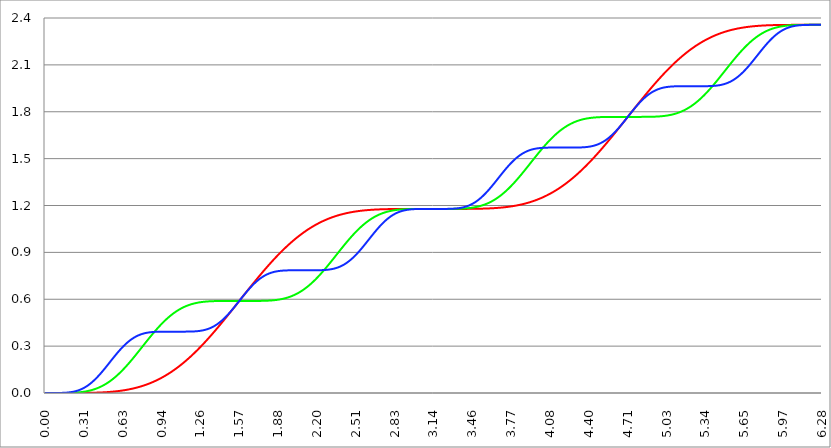
| Category | Series 1 | Series 0 | Series 2 |
|---|---|---|---|
| 0.0 | 0 | 0 | 0 |
| 0.00314159265358979 | 0 | 0 | 0 |
| 0.00628318530717958 | 0 | 0 | 0 |
| 0.00942477796076938 | 0 | 0 | 0 |
| 0.0125663706143592 | 0 | 0 | 0 |
| 0.015707963267949 | 0 | 0 | 0 |
| 0.0188495559215388 | 0 | 0 | 0 |
| 0.0219911485751285 | 0 | 0 | 0 |
| 0.0251327412287183 | 0 | 0 | 0 |
| 0.0282743338823081 | 0 | 0 | 0 |
| 0.0314159265358979 | 0 | 0 | 0 |
| 0.0345575191894877 | 0 | 0 | 0 |
| 0.0376991118430775 | 0 | 0 | 0 |
| 0.0408407044966673 | 0 | 0 | 0 |
| 0.0439822971502571 | 0 | 0 | 0 |
| 0.0471238898038469 | 0 | 0 | 0 |
| 0.0502654824574367 | 0 | 0 | 0 |
| 0.0534070751110265 | 0 | 0 | 0 |
| 0.0565486677646163 | 0 | 0 | 0 |
| 0.059690260418206 | 0 | 0 | 0 |
| 0.0628318530717958 | 0 | 0 | 0 |
| 0.0659734457253856 | 0 | 0 | 0 |
| 0.0691150383789754 | 0 | 0 | 0 |
| 0.0722566310325652 | 0 | 0 | 0 |
| 0.075398223686155 | 0 | 0 | 0 |
| 0.0785398163397448 | 0 | 0 | 0 |
| 0.0816814089933346 | 0 | 0 | 0 |
| 0.0848230016469244 | 0 | 0 | 0 |
| 0.0879645943005142 | 0 | 0 | 0 |
| 0.091106186954104 | 0 | 0 | 0 |
| 0.0942477796076937 | 0 | 0 | 0 |
| 0.0973893722612835 | 0 | 0 | 0 |
| 0.100530964914873 | 0 | 0 | 0 |
| 0.103672557568463 | 0 | 0 | 0 |
| 0.106814150222053 | 0 | 0 | 0 |
| 0.109955742875643 | 0 | 0 | 0 |
| 0.113097335529233 | 0 | 0 | 0 |
| 0.116238928182822 | 0 | 0 | 0 |
| 0.119380520836412 | 0 | 0 | 0 |
| 0.122522113490002 | 0 | 0 | 0 |
| 0.125663706143592 | 0 | 0 | 0 |
| 0.128805298797181 | 0 | 0 | 0.001 |
| 0.131946891450771 | 0 | 0 | 0.001 |
| 0.135088484104361 | 0 | 0 | 0.001 |
| 0.138230076757951 | 0 | 0 | 0.001 |
| 0.141371669411541 | 0 | 0 | 0.001 |
| 0.14451326206513 | 0 | 0 | 0.001 |
| 0.14765485471872 | 0 | 0 | 0.001 |
| 0.15079644737231 | 0 | 0 | 0.001 |
| 0.1539380400259 | 0 | 0 | 0.001 |
| 0.15707963267949 | 0 | 0 | 0.001 |
| 0.160221225333079 | 0 | 0 | 0.002 |
| 0.163362817986669 | 0 | 0 | 0.002 |
| 0.166504410640259 | 0 | 0 | 0.002 |
| 0.169646003293849 | 0 | 0 | 0.002 |
| 0.172787595947439 | 0 | 0 | 0.002 |
| 0.175929188601028 | 0 | 0.001 | 0.002 |
| 0.179070781254618 | 0 | 0.001 | 0.003 |
| 0.182212373908208 | 0 | 0.001 | 0.003 |
| 0.185353966561798 | 0 | 0.001 | 0.003 |
| 0.188495559215388 | 0 | 0.001 | 0.003 |
| 0.191637151868977 | 0 | 0.001 | 0.004 |
| 0.194778744522567 | 0 | 0.001 | 0.004 |
| 0.197920337176157 | 0 | 0.001 | 0.004 |
| 0.201061929829747 | 0 | 0.001 | 0.004 |
| 0.204203522483336 | 0 | 0.001 | 0.005 |
| 0.207345115136926 | 0 | 0.001 | 0.005 |
| 0.210486707790516 | 0 | 0.001 | 0.006 |
| 0.213628300444106 | 0 | 0.001 | 0.006 |
| 0.216769893097696 | 0 | 0.001 | 0.006 |
| 0.219911485751285 | 0 | 0.002 | 0.007 |
| 0.223053078404875 | 0 | 0.002 | 0.007 |
| 0.226194671058465 | 0 | 0.002 | 0.008 |
| 0.229336263712055 | 0 | 0.002 | 0.008 |
| 0.232477856365645 | 0 | 0.002 | 0.009 |
| 0.235619449019234 | 0 | 0.002 | 0.009 |
| 0.238761041672824 | 0 | 0.002 | 0.01 |
| 0.241902634326414 | 0 | 0.002 | 0.01 |
| 0.245044226980004 | 0 | 0.003 | 0.011 |
| 0.248185819633594 | 0 | 0.003 | 0.012 |
| 0.251327412287183 | 0 | 0.003 | 0.012 |
| 0.254469004940773 | 0 | 0.003 | 0.013 |
| 0.257610597594363 | 0 | 0.003 | 0.014 |
| 0.260752190247953 | 0 | 0.003 | 0.015 |
| 0.263893782901543 | 0 | 0.004 | 0.015 |
| 0.267035375555132 | 0 | 0.004 | 0.016 |
| 0.270176968208722 | 0 | 0.004 | 0.017 |
| 0.273318560862312 | 0 | 0.004 | 0.018 |
| 0.276460153515902 | 0 | 0.004 | 0.019 |
| 0.279601746169492 | 0 | 0.005 | 0.02 |
| 0.282743338823082 | 0 | 0.005 | 0.021 |
| 0.285884931476671 | 0 | 0.005 | 0.022 |
| 0.289026524130261 | 0 | 0.006 | 0.023 |
| 0.292168116783851 | 0 | 0.006 | 0.024 |
| 0.295309709437441 | 0 | 0.006 | 0.025 |
| 0.298451302091031 | 0 | 0.006 | 0.026 |
| 0.30159289474462 | 0 | 0.007 | 0.027 |
| 0.30473448739821 | 0.001 | 0.007 | 0.029 |
| 0.3078760800518 | 0.001 | 0.007 | 0.03 |
| 0.31101767270539 | 0.001 | 0.008 | 0.031 |
| 0.31415926535898 | 0.001 | 0.008 | 0.032 |
| 0.31730085801257 | 0.001 | 0.008 | 0.034 |
| 0.320442450666159 | 0.001 | 0.009 | 0.035 |
| 0.323584043319749 | 0.001 | 0.009 | 0.037 |
| 0.326725635973339 | 0.001 | 0.01 | 0.038 |
| 0.329867228626929 | 0.001 | 0.01 | 0.04 |
| 0.333008821280519 | 0.001 | 0.011 | 0.041 |
| 0.336150413934108 | 0.001 | 0.011 | 0.043 |
| 0.339292006587698 | 0.001 | 0.012 | 0.044 |
| 0.342433599241288 | 0.001 | 0.012 | 0.046 |
| 0.345575191894878 | 0.001 | 0.013 | 0.048 |
| 0.348716784548468 | 0.001 | 0.013 | 0.05 |
| 0.351858377202058 | 0.001 | 0.014 | 0.051 |
| 0.354999969855647 | 0.001 | 0.014 | 0.053 |
| 0.358141562509237 | 0.001 | 0.015 | 0.055 |
| 0.361283155162827 | 0.001 | 0.015 | 0.057 |
| 0.364424747816417 | 0.001 | 0.016 | 0.059 |
| 0.367566340470007 | 0.001 | 0.017 | 0.061 |
| 0.370707933123597 | 0.001 | 0.017 | 0.063 |
| 0.373849525777186 | 0.001 | 0.018 | 0.065 |
| 0.376991118430776 | 0.001 | 0.019 | 0.067 |
| 0.380132711084366 | 0.001 | 0.019 | 0.069 |
| 0.383274303737956 | 0.002 | 0.02 | 0.071 |
| 0.386415896391546 | 0.002 | 0.021 | 0.073 |
| 0.389557489045135 | 0.002 | 0.021 | 0.076 |
| 0.392699081698725 | 0.002 | 0.022 | 0.078 |
| 0.395840674352315 | 0.002 | 0.023 | 0.08 |
| 0.398982267005905 | 0.002 | 0.024 | 0.083 |
| 0.402123859659495 | 0.002 | 0.025 | 0.085 |
| 0.405265452313085 | 0.002 | 0.026 | 0.087 |
| 0.408407044966674 | 0.002 | 0.026 | 0.09 |
| 0.411548637620264 | 0.002 | 0.027 | 0.092 |
| 0.414690230273854 | 0.002 | 0.028 | 0.095 |
| 0.417831822927444 | 0.002 | 0.029 | 0.097 |
| 0.420973415581034 | 0.002 | 0.03 | 0.1 |
| 0.424115008234623 | 0.003 | 0.031 | 0.103 |
| 0.427256600888213 | 0.003 | 0.032 | 0.105 |
| 0.430398193541803 | 0.003 | 0.033 | 0.108 |
| 0.433539786195393 | 0.003 | 0.034 | 0.111 |
| 0.436681378848983 | 0.003 | 0.035 | 0.113 |
| 0.439822971502573 | 0.003 | 0.036 | 0.116 |
| 0.442964564156162 | 0.003 | 0.038 | 0.119 |
| 0.446106156809752 | 0.003 | 0.039 | 0.122 |
| 0.449247749463342 | 0.003 | 0.04 | 0.124 |
| 0.452389342116932 | 0.003 | 0.041 | 0.127 |
| 0.455530934770522 | 0.004 | 0.042 | 0.13 |
| 0.458672527424111 | 0.004 | 0.043 | 0.133 |
| 0.461814120077701 | 0.004 | 0.045 | 0.136 |
| 0.464955712731291 | 0.004 | 0.046 | 0.139 |
| 0.468097305384881 | 0.004 | 0.047 | 0.142 |
| 0.471238898038471 | 0.004 | 0.049 | 0.145 |
| 0.474380490692061 | 0.004 | 0.05 | 0.148 |
| 0.47752208334565 | 0.004 | 0.051 | 0.151 |
| 0.48066367599924 | 0.005 | 0.053 | 0.154 |
| 0.48380526865283 | 0.005 | 0.054 | 0.157 |
| 0.48694686130642 | 0.005 | 0.056 | 0.16 |
| 0.49008845396001 | 0.005 | 0.057 | 0.163 |
| 0.493230046613599 | 0.005 | 0.059 | 0.166 |
| 0.496371639267189 | 0.005 | 0.06 | 0.169 |
| 0.499513231920779 | 0.006 | 0.062 | 0.172 |
| 0.502654824574369 | 0.006 | 0.063 | 0.175 |
| 0.505796417227959 | 0.006 | 0.065 | 0.179 |
| 0.508938009881549 | 0.006 | 0.067 | 0.182 |
| 0.512079602535138 | 0.006 | 0.068 | 0.185 |
| 0.515221195188728 | 0.006 | 0.07 | 0.188 |
| 0.518362787842318 | 0.007 | 0.072 | 0.191 |
| 0.521504380495908 | 0.007 | 0.073 | 0.194 |
| 0.524645973149498 | 0.007 | 0.075 | 0.197 |
| 0.527787565803087 | 0.007 | 0.077 | 0.201 |
| 0.530929158456677 | 0.007 | 0.079 | 0.204 |
| 0.534070751110267 | 0.008 | 0.081 | 0.207 |
| 0.537212343763857 | 0.008 | 0.082 | 0.21 |
| 0.540353936417447 | 0.008 | 0.084 | 0.213 |
| 0.543495529071037 | 0.008 | 0.086 | 0.216 |
| 0.546637121724626 | 0.008 | 0.088 | 0.219 |
| 0.549778714378216 | 0.009 | 0.09 | 0.222 |
| 0.552920307031806 | 0.009 | 0.092 | 0.226 |
| 0.556061899685396 | 0.009 | 0.094 | 0.229 |
| 0.559203492338986 | 0.009 | 0.096 | 0.232 |
| 0.562345084992576 | 0.01 | 0.098 | 0.235 |
| 0.565486677646165 | 0.01 | 0.1 | 0.238 |
| 0.568628270299755 | 0.01 | 0.103 | 0.241 |
| 0.571769862953345 | 0.01 | 0.105 | 0.244 |
| 0.574911455606935 | 0.011 | 0.107 | 0.247 |
| 0.578053048260525 | 0.011 | 0.109 | 0.25 |
| 0.581194640914114 | 0.011 | 0.111 | 0.253 |
| 0.584336233567704 | 0.012 | 0.113 | 0.256 |
| 0.587477826221294 | 0.012 | 0.116 | 0.259 |
| 0.590619418874884 | 0.012 | 0.118 | 0.262 |
| 0.593761011528474 | 0.012 | 0.12 | 0.264 |
| 0.596902604182064 | 0.013 | 0.123 | 0.267 |
| 0.600044196835653 | 0.013 | 0.125 | 0.27 |
| 0.603185789489243 | 0.013 | 0.127 | 0.273 |
| 0.606327382142833 | 0.014 | 0.13 | 0.276 |
| 0.609468974796423 | 0.014 | 0.132 | 0.279 |
| 0.612610567450013 | 0.014 | 0.135 | 0.281 |
| 0.615752160103602 | 0.015 | 0.137 | 0.284 |
| 0.618893752757192 | 0.015 | 0.14 | 0.287 |
| 0.622035345410782 | 0.015 | 0.142 | 0.289 |
| 0.625176938064372 | 0.016 | 0.145 | 0.292 |
| 0.628318530717962 | 0.016 | 0.147 | 0.295 |
| 0.631460123371551 | 0.017 | 0.15 | 0.297 |
| 0.634601716025141 | 0.017 | 0.152 | 0.3 |
| 0.637743308678731 | 0.017 | 0.155 | 0.302 |
| 0.640884901332321 | 0.018 | 0.158 | 0.305 |
| 0.644026493985911 | 0.018 | 0.16 | 0.307 |
| 0.647168086639501 | 0.019 | 0.163 | 0.309 |
| 0.65030967929309 | 0.019 | 0.166 | 0.312 |
| 0.65345127194668 | 0.019 | 0.168 | 0.314 |
| 0.65659286460027 | 0.02 | 0.171 | 0.316 |
| 0.65973445725386 | 0.02 | 0.174 | 0.319 |
| 0.66287604990745 | 0.021 | 0.177 | 0.321 |
| 0.666017642561039 | 0.021 | 0.18 | 0.323 |
| 0.669159235214629 | 0.022 | 0.182 | 0.325 |
| 0.672300827868219 | 0.022 | 0.185 | 0.327 |
| 0.675442420521809 | 0.023 | 0.188 | 0.329 |
| 0.678584013175399 | 0.023 | 0.191 | 0.331 |
| 0.681725605828989 | 0.024 | 0.194 | 0.333 |
| 0.684867198482578 | 0.024 | 0.197 | 0.335 |
| 0.688008791136168 | 0.025 | 0.2 | 0.337 |
| 0.691150383789758 | 0.025 | 0.202 | 0.339 |
| 0.694291976443348 | 0.026 | 0.205 | 0.341 |
| 0.697433569096938 | 0.026 | 0.208 | 0.343 |
| 0.700575161750528 | 0.027 | 0.211 | 0.344 |
| 0.703716754404117 | 0.027 | 0.214 | 0.346 |
| 0.706858347057707 | 0.028 | 0.217 | 0.348 |
| 0.709999939711297 | 0.028 | 0.22 | 0.349 |
| 0.713141532364887 | 0.029 | 0.223 | 0.351 |
| 0.716283125018477 | 0.03 | 0.226 | 0.353 |
| 0.719424717672066 | 0.03 | 0.229 | 0.354 |
| 0.722566310325656 | 0.031 | 0.232 | 0.356 |
| 0.725707902979246 | 0.031 | 0.235 | 0.357 |
| 0.728849495632836 | 0.032 | 0.238 | 0.358 |
| 0.731991088286426 | 0.033 | 0.242 | 0.36 |
| 0.735132680940016 | 0.033 | 0.245 | 0.361 |
| 0.738274273593605 | 0.034 | 0.248 | 0.362 |
| 0.741415866247195 | 0.034 | 0.251 | 0.364 |
| 0.744557458900785 | 0.035 | 0.254 | 0.365 |
| 0.747699051554375 | 0.036 | 0.257 | 0.366 |
| 0.750840644207965 | 0.036 | 0.26 | 0.367 |
| 0.753982236861554 | 0.037 | 0.263 | 0.368 |
| 0.757123829515144 | 0.038 | 0.266 | 0.37 |
| 0.760265422168734 | 0.039 | 0.269 | 0.371 |
| 0.763407014822324 | 0.039 | 0.273 | 0.372 |
| 0.766548607475914 | 0.04 | 0.276 | 0.373 |
| 0.769690200129504 | 0.041 | 0.279 | 0.374 |
| 0.772831792783093 | 0.041 | 0.282 | 0.374 |
| 0.775973385436683 | 0.042 | 0.285 | 0.375 |
| 0.779114978090273 | 0.043 | 0.288 | 0.376 |
| 0.782256570743863 | 0.044 | 0.291 | 0.377 |
| 0.785398163397453 | 0.045 | 0.295 | 0.378 |
| 0.788539756051042 | 0.045 | 0.298 | 0.379 |
| 0.791681348704632 | 0.046 | 0.301 | 0.379 |
| 0.794822941358222 | 0.047 | 0.304 | 0.38 |
| 0.797964534011812 | 0.048 | 0.307 | 0.381 |
| 0.801106126665402 | 0.049 | 0.31 | 0.381 |
| 0.804247719318992 | 0.049 | 0.313 | 0.382 |
| 0.807389311972581 | 0.05 | 0.316 | 0.383 |
| 0.810530904626171 | 0.051 | 0.32 | 0.383 |
| 0.813672497279761 | 0.052 | 0.323 | 0.384 |
| 0.816814089933351 | 0.053 | 0.326 | 0.384 |
| 0.819955682586941 | 0.054 | 0.329 | 0.385 |
| 0.823097275240531 | 0.055 | 0.332 | 0.385 |
| 0.82623886789412 | 0.056 | 0.335 | 0.386 |
| 0.82938046054771 | 0.057 | 0.338 | 0.386 |
| 0.8325220532013 | 0.057 | 0.341 | 0.387 |
| 0.83566364585489 | 0.058 | 0.344 | 0.387 |
| 0.83880523850848 | 0.059 | 0.348 | 0.387 |
| 0.841946831162069 | 0.06 | 0.351 | 0.388 |
| 0.845088423815659 | 0.061 | 0.354 | 0.388 |
| 0.848230016469249 | 0.062 | 0.357 | 0.388 |
| 0.851371609122839 | 0.063 | 0.36 | 0.389 |
| 0.854513201776429 | 0.064 | 0.363 | 0.389 |
| 0.857654794430019 | 0.065 | 0.366 | 0.389 |
| 0.860796387083608 | 0.066 | 0.369 | 0.39 |
| 0.863937979737198 | 0.067 | 0.372 | 0.39 |
| 0.867079572390788 | 0.068 | 0.375 | 0.39 |
| 0.870221165044378 | 0.07 | 0.378 | 0.39 |
| 0.873362757697968 | 0.071 | 0.381 | 0.39 |
| 0.876504350351557 | 0.072 | 0.384 | 0.391 |
| 0.879645943005147 | 0.073 | 0.387 | 0.391 |
| 0.882787535658737 | 0.074 | 0.389 | 0.391 |
| 0.885929128312327 | 0.075 | 0.392 | 0.391 |
| 0.889070720965917 | 0.076 | 0.395 | 0.391 |
| 0.892212313619507 | 0.077 | 0.398 | 0.391 |
| 0.895353906273096 | 0.078 | 0.401 | 0.392 |
| 0.898495498926686 | 0.08 | 0.404 | 0.392 |
| 0.901637091580276 | 0.081 | 0.407 | 0.392 |
| 0.904778684233866 | 0.082 | 0.409 | 0.392 |
| 0.907920276887456 | 0.083 | 0.412 | 0.392 |
| 0.911061869541045 | 0.084 | 0.415 | 0.392 |
| 0.914203462194635 | 0.086 | 0.418 | 0.392 |
| 0.917345054848225 | 0.087 | 0.421 | 0.392 |
| 0.920486647501815 | 0.088 | 0.423 | 0.392 |
| 0.923628240155405 | 0.089 | 0.426 | 0.392 |
| 0.926769832808995 | 0.091 | 0.429 | 0.392 |
| 0.929911425462584 | 0.092 | 0.431 | 0.392 |
| 0.933053018116174 | 0.093 | 0.434 | 0.392 |
| 0.936194610769764 | 0.095 | 0.437 | 0.392 |
| 0.939336203423354 | 0.096 | 0.439 | 0.392 |
| 0.942477796076944 | 0.097 | 0.442 | 0.393 |
| 0.945619388730533 | 0.099 | 0.444 | 0.393 |
| 0.948760981384123 | 0.1 | 0.447 | 0.393 |
| 0.951902574037713 | 0.101 | 0.449 | 0.393 |
| 0.955044166691303 | 0.103 | 0.452 | 0.393 |
| 0.958185759344893 | 0.104 | 0.454 | 0.393 |
| 0.961327351998483 | 0.106 | 0.457 | 0.393 |
| 0.964468944652072 | 0.107 | 0.459 | 0.393 |
| 0.967610537305662 | 0.108 | 0.462 | 0.393 |
| 0.970752129959252 | 0.11 | 0.464 | 0.393 |
| 0.973893722612842 | 0.111 | 0.466 | 0.393 |
| 0.977035315266432 | 0.113 | 0.469 | 0.393 |
| 0.980176907920022 | 0.114 | 0.471 | 0.393 |
| 0.983318500573611 | 0.116 | 0.473 | 0.393 |
| 0.986460093227201 | 0.117 | 0.476 | 0.393 |
| 0.989601685880791 | 0.119 | 0.478 | 0.393 |
| 0.992743278534381 | 0.12 | 0.48 | 0.393 |
| 0.995884871187971 | 0.122 | 0.482 | 0.393 |
| 0.99902646384156 | 0.124 | 0.484 | 0.393 |
| 1.00216805649515 | 0.125 | 0.487 | 0.393 |
| 1.00530964914874 | 0.127 | 0.489 | 0.393 |
| 1.00845124180233 | 0.128 | 0.491 | 0.393 |
| 1.01159283445592 | 0.13 | 0.493 | 0.393 |
| 1.01473442710951 | 0.132 | 0.495 | 0.393 |
| 1.017876019763099 | 0.133 | 0.497 | 0.393 |
| 1.021017612416689 | 0.135 | 0.499 | 0.393 |
| 1.02415920507028 | 0.137 | 0.501 | 0.393 |
| 1.027300797723869 | 0.138 | 0.503 | 0.393 |
| 1.030442390377459 | 0.14 | 0.505 | 0.393 |
| 1.033583983031048 | 0.142 | 0.507 | 0.393 |
| 1.036725575684638 | 0.143 | 0.508 | 0.393 |
| 1.039867168338228 | 0.145 | 0.51 | 0.393 |
| 1.043008760991818 | 0.147 | 0.512 | 0.393 |
| 1.046150353645408 | 0.149 | 0.514 | 0.393 |
| 1.049291946298998 | 0.15 | 0.516 | 0.393 |
| 1.052433538952587 | 0.152 | 0.517 | 0.393 |
| 1.055575131606177 | 0.154 | 0.519 | 0.393 |
| 1.058716724259767 | 0.156 | 0.521 | 0.393 |
| 1.061858316913357 | 0.158 | 0.522 | 0.393 |
| 1.064999909566947 | 0.159 | 0.524 | 0.393 |
| 1.068141502220536 | 0.161 | 0.526 | 0.393 |
| 1.071283094874126 | 0.163 | 0.527 | 0.393 |
| 1.074424687527716 | 0.165 | 0.529 | 0.393 |
| 1.077566280181306 | 0.167 | 0.53 | 0.393 |
| 1.080707872834896 | 0.169 | 0.532 | 0.393 |
| 1.083849465488486 | 0.171 | 0.533 | 0.393 |
| 1.086991058142075 | 0.173 | 0.535 | 0.393 |
| 1.090132650795665 | 0.174 | 0.536 | 0.393 |
| 1.093274243449255 | 0.176 | 0.538 | 0.393 |
| 1.096415836102845 | 0.178 | 0.539 | 0.393 |
| 1.099557428756435 | 0.18 | 0.54 | 0.393 |
| 1.102699021410025 | 0.182 | 0.542 | 0.393 |
| 1.105840614063614 | 0.184 | 0.543 | 0.393 |
| 1.108982206717204 | 0.186 | 0.544 | 0.393 |
| 1.112123799370794 | 0.188 | 0.546 | 0.393 |
| 1.115265392024384 | 0.19 | 0.547 | 0.393 |
| 1.118406984677974 | 0.192 | 0.548 | 0.393 |
| 1.121548577331563 | 0.195 | 0.549 | 0.393 |
| 1.124690169985153 | 0.197 | 0.55 | 0.393 |
| 1.127831762638743 | 0.199 | 0.552 | 0.393 |
| 1.130973355292333 | 0.201 | 0.553 | 0.393 |
| 1.134114947945923 | 0.203 | 0.554 | 0.393 |
| 1.137256540599513 | 0.205 | 0.555 | 0.393 |
| 1.140398133253102 | 0.207 | 0.556 | 0.393 |
| 1.143539725906692 | 0.209 | 0.557 | 0.393 |
| 1.146681318560282 | 0.211 | 0.558 | 0.393 |
| 1.149822911213872 | 0.214 | 0.559 | 0.393 |
| 1.152964503867462 | 0.216 | 0.56 | 0.393 |
| 1.156106096521051 | 0.218 | 0.561 | 0.393 |
| 1.159247689174641 | 0.22 | 0.562 | 0.393 |
| 1.162389281828231 | 0.222 | 0.563 | 0.393 |
| 1.165530874481821 | 0.225 | 0.563 | 0.393 |
| 1.168672467135411 | 0.227 | 0.564 | 0.393 |
| 1.171814059789001 | 0.229 | 0.565 | 0.393 |
| 1.17495565244259 | 0.231 | 0.566 | 0.393 |
| 1.17809724509618 | 0.234 | 0.567 | 0.393 |
| 1.18123883774977 | 0.236 | 0.568 | 0.393 |
| 1.18438043040336 | 0.238 | 0.568 | 0.393 |
| 1.18752202305695 | 0.241 | 0.569 | 0.394 |
| 1.190663615710539 | 0.243 | 0.57 | 0.394 |
| 1.193805208364129 | 0.245 | 0.57 | 0.394 |
| 1.19694680101772 | 0.248 | 0.571 | 0.394 |
| 1.200088393671309 | 0.25 | 0.572 | 0.394 |
| 1.203229986324899 | 0.252 | 0.572 | 0.394 |
| 1.206371578978489 | 0.255 | 0.573 | 0.394 |
| 1.209513171632078 | 0.257 | 0.574 | 0.394 |
| 1.212654764285668 | 0.26 | 0.574 | 0.394 |
| 1.215796356939258 | 0.262 | 0.575 | 0.395 |
| 1.218937949592848 | 0.265 | 0.575 | 0.395 |
| 1.222079542246438 | 0.267 | 0.576 | 0.395 |
| 1.225221134900027 | 0.269 | 0.576 | 0.395 |
| 1.228362727553617 | 0.272 | 0.577 | 0.395 |
| 1.231504320207207 | 0.274 | 0.577 | 0.396 |
| 1.234645912860797 | 0.277 | 0.578 | 0.396 |
| 1.237787505514387 | 0.279 | 0.578 | 0.396 |
| 1.240929098167977 | 0.282 | 0.579 | 0.396 |
| 1.244070690821566 | 0.284 | 0.579 | 0.397 |
| 1.247212283475156 | 0.287 | 0.58 | 0.397 |
| 1.250353876128746 | 0.289 | 0.58 | 0.397 |
| 1.253495468782336 | 0.292 | 0.581 | 0.398 |
| 1.256637061435926 | 0.295 | 0.581 | 0.398 |
| 1.259778654089515 | 0.297 | 0.581 | 0.398 |
| 1.262920246743105 | 0.3 | 0.582 | 0.399 |
| 1.266061839396695 | 0.302 | 0.582 | 0.399 |
| 1.269203432050285 | 0.305 | 0.582 | 0.4 |
| 1.272345024703875 | 0.308 | 0.583 | 0.4 |
| 1.275486617357465 | 0.31 | 0.583 | 0.401 |
| 1.278628210011054 | 0.313 | 0.583 | 0.401 |
| 1.281769802664644 | 0.315 | 0.584 | 0.402 |
| 1.284911395318234 | 0.318 | 0.584 | 0.402 |
| 1.288052987971824 | 0.321 | 0.584 | 0.403 |
| 1.291194580625414 | 0.323 | 0.584 | 0.404 |
| 1.294336173279003 | 0.326 | 0.585 | 0.404 |
| 1.297477765932593 | 0.329 | 0.585 | 0.405 |
| 1.300619358586183 | 0.332 | 0.585 | 0.406 |
| 1.303760951239773 | 0.334 | 0.585 | 0.406 |
| 1.306902543893363 | 0.337 | 0.585 | 0.407 |
| 1.310044136546953 | 0.34 | 0.586 | 0.408 |
| 1.313185729200542 | 0.342 | 0.586 | 0.409 |
| 1.316327321854132 | 0.345 | 0.586 | 0.409 |
| 1.319468914507722 | 0.348 | 0.586 | 0.41 |
| 1.322610507161312 | 0.351 | 0.586 | 0.411 |
| 1.325752099814902 | 0.354 | 0.587 | 0.412 |
| 1.328893692468491 | 0.356 | 0.587 | 0.413 |
| 1.332035285122081 | 0.359 | 0.587 | 0.414 |
| 1.335176877775671 | 0.362 | 0.587 | 0.415 |
| 1.338318470429261 | 0.365 | 0.587 | 0.416 |
| 1.341460063082851 | 0.368 | 0.587 | 0.417 |
| 1.344601655736441 | 0.37 | 0.587 | 0.418 |
| 1.34774324839003 | 0.373 | 0.587 | 0.42 |
| 1.35088484104362 | 0.376 | 0.588 | 0.421 |
| 1.35402643369721 | 0.379 | 0.588 | 0.422 |
| 1.3571680263508 | 0.382 | 0.588 | 0.423 |
| 1.36030961900439 | 0.385 | 0.588 | 0.425 |
| 1.363451211657979 | 0.388 | 0.588 | 0.426 |
| 1.36659280431157 | 0.39 | 0.588 | 0.427 |
| 1.369734396965159 | 0.393 | 0.588 | 0.429 |
| 1.372875989618749 | 0.396 | 0.588 | 0.43 |
| 1.376017582272339 | 0.399 | 0.588 | 0.432 |
| 1.379159174925929 | 0.402 | 0.588 | 0.433 |
| 1.382300767579518 | 0.405 | 0.588 | 0.435 |
| 1.385442360233108 | 0.408 | 0.588 | 0.437 |
| 1.388583952886698 | 0.411 | 0.588 | 0.438 |
| 1.391725545540288 | 0.414 | 0.588 | 0.44 |
| 1.394867138193878 | 0.417 | 0.589 | 0.442 |
| 1.398008730847468 | 0.42 | 0.589 | 0.443 |
| 1.401150323501057 | 0.423 | 0.589 | 0.445 |
| 1.404291916154647 | 0.426 | 0.589 | 0.447 |
| 1.407433508808237 | 0.429 | 0.589 | 0.449 |
| 1.410575101461827 | 0.432 | 0.589 | 0.451 |
| 1.413716694115417 | 0.435 | 0.589 | 0.453 |
| 1.416858286769006 | 0.438 | 0.589 | 0.455 |
| 1.419999879422596 | 0.441 | 0.589 | 0.457 |
| 1.423141472076186 | 0.444 | 0.589 | 0.459 |
| 1.426283064729776 | 0.447 | 0.589 | 0.461 |
| 1.429424657383366 | 0.45 | 0.589 | 0.463 |
| 1.432566250036956 | 0.453 | 0.589 | 0.465 |
| 1.435707842690545 | 0.456 | 0.589 | 0.468 |
| 1.438849435344135 | 0.459 | 0.589 | 0.47 |
| 1.441991027997725 | 0.462 | 0.589 | 0.472 |
| 1.445132620651315 | 0.465 | 0.589 | 0.474 |
| 1.448274213304905 | 0.468 | 0.589 | 0.477 |
| 1.451415805958494 | 0.471 | 0.589 | 0.479 |
| 1.454557398612084 | 0.474 | 0.589 | 0.482 |
| 1.457698991265674 | 0.477 | 0.589 | 0.484 |
| 1.460840583919264 | 0.48 | 0.589 | 0.487 |
| 1.463982176572854 | 0.483 | 0.589 | 0.489 |
| 1.467123769226444 | 0.486 | 0.589 | 0.492 |
| 1.470265361880033 | 0.489 | 0.589 | 0.494 |
| 1.473406954533623 | 0.492 | 0.589 | 0.497 |
| 1.476548547187213 | 0.495 | 0.589 | 0.5 |
| 1.479690139840803 | 0.498 | 0.589 | 0.502 |
| 1.482831732494393 | 0.502 | 0.589 | 0.505 |
| 1.485973325147982 | 0.505 | 0.589 | 0.508 |
| 1.489114917801572 | 0.508 | 0.589 | 0.511 |
| 1.492256510455162 | 0.511 | 0.589 | 0.513 |
| 1.495398103108752 | 0.514 | 0.589 | 0.516 |
| 1.498539695762342 | 0.517 | 0.589 | 0.519 |
| 1.501681288415932 | 0.52 | 0.589 | 0.522 |
| 1.504822881069521 | 0.523 | 0.589 | 0.525 |
| 1.507964473723111 | 0.526 | 0.589 | 0.528 |
| 1.511106066376701 | 0.529 | 0.589 | 0.531 |
| 1.514247659030291 | 0.533 | 0.589 | 0.534 |
| 1.517389251683881 | 0.536 | 0.589 | 0.537 |
| 1.520530844337471 | 0.539 | 0.589 | 0.54 |
| 1.52367243699106 | 0.542 | 0.589 | 0.543 |
| 1.52681402964465 | 0.545 | 0.589 | 0.546 |
| 1.52995562229824 | 0.548 | 0.589 | 0.549 |
| 1.53309721495183 | 0.551 | 0.589 | 0.552 |
| 1.53623880760542 | 0.555 | 0.589 | 0.555 |
| 1.539380400259009 | 0.558 | 0.589 | 0.558 |
| 1.542521992912599 | 0.561 | 0.589 | 0.561 |
| 1.545663585566189 | 0.564 | 0.589 | 0.564 |
| 1.548805178219779 | 0.567 | 0.589 | 0.567 |
| 1.551946770873369 | 0.57 | 0.589 | 0.57 |
| 1.555088363526959 | 0.573 | 0.589 | 0.573 |
| 1.558229956180548 | 0.576 | 0.589 | 0.576 |
| 1.561371548834138 | 0.58 | 0.589 | 0.58 |
| 1.564513141487728 | 0.583 | 0.589 | 0.583 |
| 1.567654734141318 | 0.586 | 0.589 | 0.586 |
| 1.570796326794908 | 0.589 | 0.589 | 0.589 |
| 1.573937919448497 | 0.592 | 0.589 | 0.592 |
| 1.577079512102087 | 0.595 | 0.589 | 0.595 |
| 1.580221104755677 | 0.598 | 0.589 | 0.598 |
| 1.583362697409267 | 0.602 | 0.589 | 0.602 |
| 1.586504290062857 | 0.605 | 0.589 | 0.605 |
| 1.589645882716447 | 0.608 | 0.589 | 0.608 |
| 1.592787475370036 | 0.611 | 0.589 | 0.611 |
| 1.595929068023626 | 0.614 | 0.589 | 0.614 |
| 1.599070660677216 | 0.617 | 0.589 | 0.617 |
| 1.602212253330806 | 0.62 | 0.589 | 0.62 |
| 1.605353845984396 | 0.624 | 0.589 | 0.623 |
| 1.608495438637985 | 0.627 | 0.589 | 0.626 |
| 1.611637031291575 | 0.63 | 0.589 | 0.629 |
| 1.614778623945165 | 0.633 | 0.589 | 0.633 |
| 1.617920216598755 | 0.636 | 0.589 | 0.636 |
| 1.621061809252345 | 0.639 | 0.589 | 0.639 |
| 1.624203401905935 | 0.642 | 0.589 | 0.642 |
| 1.627344994559524 | 0.645 | 0.589 | 0.645 |
| 1.630486587213114 | 0.649 | 0.589 | 0.647 |
| 1.633628179866704 | 0.652 | 0.589 | 0.65 |
| 1.636769772520294 | 0.655 | 0.589 | 0.653 |
| 1.639911365173884 | 0.658 | 0.589 | 0.656 |
| 1.643052957827473 | 0.661 | 0.589 | 0.659 |
| 1.646194550481063 | 0.664 | 0.589 | 0.662 |
| 1.649336143134653 | 0.667 | 0.589 | 0.665 |
| 1.652477735788243 | 0.67 | 0.589 | 0.668 |
| 1.655619328441833 | 0.673 | 0.589 | 0.67 |
| 1.658760921095423 | 0.677 | 0.589 | 0.673 |
| 1.661902513749012 | 0.68 | 0.589 | 0.676 |
| 1.665044106402602 | 0.683 | 0.589 | 0.678 |
| 1.668185699056192 | 0.686 | 0.589 | 0.681 |
| 1.671327291709782 | 0.689 | 0.589 | 0.684 |
| 1.674468884363372 | 0.692 | 0.589 | 0.686 |
| 1.677610477016961 | 0.695 | 0.589 | 0.689 |
| 1.680752069670551 | 0.698 | 0.589 | 0.691 |
| 1.683893662324141 | 0.701 | 0.589 | 0.694 |
| 1.687035254977731 | 0.704 | 0.589 | 0.696 |
| 1.690176847631321 | 0.707 | 0.589 | 0.699 |
| 1.693318440284911 | 0.71 | 0.589 | 0.701 |
| 1.6964600329385 | 0.713 | 0.589 | 0.704 |
| 1.69960162559209 | 0.716 | 0.589 | 0.706 |
| 1.70274321824568 | 0.719 | 0.589 | 0.708 |
| 1.70588481089927 | 0.723 | 0.589 | 0.71 |
| 1.70902640355286 | 0.726 | 0.589 | 0.713 |
| 1.712167996206449 | 0.729 | 0.589 | 0.715 |
| 1.715309588860039 | 0.732 | 0.589 | 0.717 |
| 1.71845118151363 | 0.735 | 0.589 | 0.719 |
| 1.721592774167219 | 0.738 | 0.589 | 0.721 |
| 1.724734366820809 | 0.741 | 0.589 | 0.723 |
| 1.727875959474399 | 0.744 | 0.589 | 0.725 |
| 1.731017552127988 | 0.747 | 0.589 | 0.727 |
| 1.734159144781578 | 0.75 | 0.589 | 0.729 |
| 1.737300737435168 | 0.753 | 0.589 | 0.731 |
| 1.740442330088758 | 0.755 | 0.589 | 0.733 |
| 1.743583922742348 | 0.758 | 0.59 | 0.735 |
| 1.746725515395937 | 0.761 | 0.59 | 0.736 |
| 1.749867108049527 | 0.764 | 0.59 | 0.738 |
| 1.753008700703117 | 0.767 | 0.59 | 0.74 |
| 1.756150293356707 | 0.77 | 0.59 | 0.742 |
| 1.759291886010297 | 0.773 | 0.59 | 0.743 |
| 1.762433478663887 | 0.776 | 0.59 | 0.745 |
| 1.765575071317476 | 0.779 | 0.59 | 0.746 |
| 1.768716663971066 | 0.782 | 0.59 | 0.748 |
| 1.771858256624656 | 0.785 | 0.59 | 0.749 |
| 1.774999849278246 | 0.788 | 0.59 | 0.751 |
| 1.778141441931836 | 0.791 | 0.59 | 0.752 |
| 1.781283034585426 | 0.793 | 0.59 | 0.753 |
| 1.784424627239015 | 0.796 | 0.59 | 0.755 |
| 1.787566219892605 | 0.799 | 0.59 | 0.756 |
| 1.790707812546195 | 0.802 | 0.591 | 0.757 |
| 1.793849405199785 | 0.805 | 0.591 | 0.758 |
| 1.796990997853375 | 0.808 | 0.591 | 0.76 |
| 1.800132590506964 | 0.811 | 0.591 | 0.761 |
| 1.803274183160554 | 0.813 | 0.591 | 0.762 |
| 1.806415775814144 | 0.816 | 0.591 | 0.763 |
| 1.809557368467734 | 0.819 | 0.591 | 0.764 |
| 1.812698961121324 | 0.822 | 0.591 | 0.765 |
| 1.815840553774914 | 0.825 | 0.592 | 0.766 |
| 1.818982146428503 | 0.827 | 0.592 | 0.767 |
| 1.822123739082093 | 0.83 | 0.592 | 0.768 |
| 1.825265331735683 | 0.833 | 0.592 | 0.769 |
| 1.828406924389273 | 0.836 | 0.592 | 0.769 |
| 1.831548517042863 | 0.838 | 0.592 | 0.77 |
| 1.834690109696452 | 0.841 | 0.593 | 0.771 |
| 1.837831702350042 | 0.844 | 0.593 | 0.772 |
| 1.840973295003632 | 0.847 | 0.593 | 0.773 |
| 1.844114887657222 | 0.849 | 0.593 | 0.773 |
| 1.847256480310812 | 0.852 | 0.594 | 0.774 |
| 1.850398072964402 | 0.855 | 0.594 | 0.775 |
| 1.853539665617991 | 0.857 | 0.594 | 0.775 |
| 1.856681258271581 | 0.86 | 0.594 | 0.776 |
| 1.859822850925171 | 0.863 | 0.595 | 0.776 |
| 1.862964443578761 | 0.865 | 0.595 | 0.777 |
| 1.866106036232351 | 0.868 | 0.595 | 0.777 |
| 1.86924762888594 | 0.871 | 0.595 | 0.778 |
| 1.87238922153953 | 0.873 | 0.596 | 0.778 |
| 1.87553081419312 | 0.876 | 0.596 | 0.779 |
| 1.87867240684671 | 0.878 | 0.596 | 0.779 |
| 1.8818139995003 | 0.881 | 0.597 | 0.78 |
| 1.88495559215389 | 0.884 | 0.597 | 0.78 |
| 1.888097184807479 | 0.886 | 0.598 | 0.78 |
| 1.891238777461069 | 0.889 | 0.598 | 0.781 |
| 1.89438037011466 | 0.891 | 0.598 | 0.781 |
| 1.897521962768249 | 0.894 | 0.599 | 0.781 |
| 1.900663555421839 | 0.896 | 0.599 | 0.782 |
| 1.903805148075429 | 0.899 | 0.6 | 0.782 |
| 1.906946740729018 | 0.901 | 0.6 | 0.782 |
| 1.910088333382608 | 0.904 | 0.601 | 0.782 |
| 1.913229926036198 | 0.906 | 0.601 | 0.783 |
| 1.916371518689788 | 0.909 | 0.602 | 0.783 |
| 1.919513111343378 | 0.911 | 0.602 | 0.783 |
| 1.922654703996967 | 0.914 | 0.603 | 0.783 |
| 1.925796296650557 | 0.916 | 0.603 | 0.783 |
| 1.928937889304147 | 0.918 | 0.604 | 0.784 |
| 1.932079481957737 | 0.921 | 0.604 | 0.784 |
| 1.935221074611327 | 0.923 | 0.605 | 0.784 |
| 1.938362667264917 | 0.926 | 0.606 | 0.784 |
| 1.941504259918506 | 0.928 | 0.606 | 0.784 |
| 1.944645852572096 | 0.93 | 0.607 | 0.784 |
| 1.947787445225686 | 0.933 | 0.608 | 0.784 |
| 1.950929037879276 | 0.935 | 0.608 | 0.784 |
| 1.954070630532866 | 0.937 | 0.609 | 0.785 |
| 1.957212223186455 | 0.94 | 0.61 | 0.785 |
| 1.960353815840045 | 0.942 | 0.611 | 0.785 |
| 1.963495408493635 | 0.944 | 0.611 | 0.785 |
| 1.966637001147225 | 0.947 | 0.612 | 0.785 |
| 1.969778593800815 | 0.949 | 0.613 | 0.785 |
| 1.972920186454405 | 0.951 | 0.614 | 0.785 |
| 1.976061779107994 | 0.953 | 0.615 | 0.785 |
| 1.979203371761584 | 0.956 | 0.615 | 0.785 |
| 1.982344964415174 | 0.958 | 0.616 | 0.785 |
| 1.985486557068764 | 0.96 | 0.617 | 0.785 |
| 1.988628149722354 | 0.962 | 0.618 | 0.785 |
| 1.991769742375943 | 0.964 | 0.619 | 0.785 |
| 1.994911335029533 | 0.967 | 0.62 | 0.785 |
| 1.998052927683123 | 0.969 | 0.621 | 0.785 |
| 2.001194520336712 | 0.971 | 0.622 | 0.785 |
| 2.004336112990302 | 0.973 | 0.623 | 0.785 |
| 2.007477705643892 | 0.975 | 0.624 | 0.785 |
| 2.010619298297482 | 0.977 | 0.625 | 0.785 |
| 2.013760890951071 | 0.979 | 0.627 | 0.785 |
| 2.016902483604661 | 0.981 | 0.628 | 0.785 |
| 2.02004407625825 | 0.984 | 0.629 | 0.785 |
| 2.02318566891184 | 0.986 | 0.63 | 0.785 |
| 2.02632726156543 | 0.988 | 0.631 | 0.785 |
| 2.029468854219019 | 0.99 | 0.633 | 0.785 |
| 2.032610446872609 | 0.992 | 0.634 | 0.785 |
| 2.035752039526198 | 0.994 | 0.635 | 0.785 |
| 2.038893632179788 | 0.996 | 0.636 | 0.785 |
| 2.042035224833378 | 0.998 | 0.638 | 0.785 |
| 2.045176817486967 | 1 | 0.639 | 0.785 |
| 2.048318410140557 | 1.002 | 0.64 | 0.785 |
| 2.051460002794146 | 1.004 | 0.642 | 0.785 |
| 2.054601595447736 | 1.006 | 0.643 | 0.785 |
| 2.057743188101325 | 1.007 | 0.645 | 0.785 |
| 2.060884780754915 | 1.009 | 0.646 | 0.785 |
| 2.064026373408505 | 1.011 | 0.648 | 0.785 |
| 2.067167966062094 | 1.013 | 0.649 | 0.785 |
| 2.070309558715684 | 1.015 | 0.651 | 0.785 |
| 2.073451151369273 | 1.017 | 0.652 | 0.785 |
| 2.076592744022863 | 1.019 | 0.654 | 0.785 |
| 2.079734336676452 | 1.021 | 0.656 | 0.785 |
| 2.082875929330042 | 1.022 | 0.657 | 0.785 |
| 2.086017521983632 | 1.024 | 0.659 | 0.785 |
| 2.089159114637221 | 1.026 | 0.661 | 0.785 |
| 2.092300707290811 | 1.028 | 0.662 | 0.785 |
| 2.095442299944401 | 1.03 | 0.664 | 0.785 |
| 2.09858389259799 | 1.031 | 0.666 | 0.785 |
| 2.10172548525158 | 1.033 | 0.668 | 0.785 |
| 2.104867077905169 | 1.035 | 0.67 | 0.785 |
| 2.108008670558759 | 1.037 | 0.672 | 0.785 |
| 2.111150263212349 | 1.038 | 0.673 | 0.785 |
| 2.114291855865938 | 1.04 | 0.675 | 0.785 |
| 2.117433448519528 | 1.042 | 0.677 | 0.785 |
| 2.120575041173117 | 1.043 | 0.679 | 0.785 |
| 2.123716633826707 | 1.045 | 0.681 | 0.785 |
| 2.126858226480297 | 1.047 | 0.683 | 0.785 |
| 2.129999819133886 | 1.048 | 0.685 | 0.785 |
| 2.133141411787476 | 1.05 | 0.687 | 0.785 |
| 2.136283004441065 | 1.051 | 0.689 | 0.785 |
| 2.139424597094655 | 1.053 | 0.692 | 0.785 |
| 2.142566189748245 | 1.055 | 0.694 | 0.785 |
| 2.145707782401834 | 1.056 | 0.696 | 0.785 |
| 2.148849375055424 | 1.058 | 0.698 | 0.785 |
| 2.151990967709013 | 1.059 | 0.7 | 0.785 |
| 2.155132560362603 | 1.061 | 0.703 | 0.785 |
| 2.158274153016193 | 1.062 | 0.705 | 0.785 |
| 2.161415745669782 | 1.064 | 0.707 | 0.785 |
| 2.164557338323372 | 1.065 | 0.709 | 0.785 |
| 2.167698930976961 | 1.067 | 0.712 | 0.785 |
| 2.170840523630551 | 1.068 | 0.714 | 0.785 |
| 2.173982116284141 | 1.07 | 0.716 | 0.785 |
| 2.17712370893773 | 1.071 | 0.719 | 0.785 |
| 2.18026530159132 | 1.073 | 0.721 | 0.785 |
| 2.183406894244909 | 1.074 | 0.724 | 0.785 |
| 2.186548486898499 | 1.075 | 0.726 | 0.786 |
| 2.189690079552089 | 1.077 | 0.729 | 0.786 |
| 2.192831672205678 | 1.078 | 0.731 | 0.786 |
| 2.195973264859268 | 1.079 | 0.734 | 0.786 |
| 2.199114857512857 | 1.081 | 0.736 | 0.786 |
| 2.202256450166447 | 1.082 | 0.739 | 0.786 |
| 2.205398042820036 | 1.083 | 0.742 | 0.786 |
| 2.208539635473626 | 1.085 | 0.744 | 0.786 |
| 2.211681228127216 | 1.086 | 0.747 | 0.786 |
| 2.214822820780805 | 1.087 | 0.749 | 0.786 |
| 2.217964413434395 | 1.089 | 0.752 | 0.786 |
| 2.221106006087984 | 1.09 | 0.755 | 0.786 |
| 2.224247598741574 | 1.091 | 0.758 | 0.786 |
| 2.227389191395164 | 1.092 | 0.76 | 0.786 |
| 2.230530784048753 | 1.094 | 0.763 | 0.786 |
| 2.233672376702343 | 1.095 | 0.766 | 0.786 |
| 2.236813969355933 | 1.096 | 0.769 | 0.786 |
| 2.239955562009522 | 1.097 | 0.771 | 0.786 |
| 2.243097154663112 | 1.098 | 0.774 | 0.786 |
| 2.246238747316701 | 1.1 | 0.777 | 0.787 |
| 2.249380339970291 | 1.101 | 0.78 | 0.787 |
| 2.252521932623881 | 1.102 | 0.783 | 0.787 |
| 2.25566352527747 | 1.103 | 0.786 | 0.787 |
| 2.25880511793106 | 1.104 | 0.789 | 0.787 |
| 2.261946710584649 | 1.105 | 0.792 | 0.787 |
| 2.265088303238239 | 1.106 | 0.794 | 0.787 |
| 2.268229895891829 | 1.107 | 0.797 | 0.788 |
| 2.271371488545418 | 1.109 | 0.8 | 0.788 |
| 2.274513081199008 | 1.11 | 0.803 | 0.788 |
| 2.277654673852597 | 1.111 | 0.806 | 0.788 |
| 2.280796266506186 | 1.112 | 0.809 | 0.789 |
| 2.283937859159776 | 1.113 | 0.812 | 0.789 |
| 2.287079451813366 | 1.114 | 0.815 | 0.789 |
| 2.290221044466955 | 1.115 | 0.818 | 0.789 |
| 2.293362637120545 | 1.116 | 0.821 | 0.79 |
| 2.296504229774135 | 1.117 | 0.824 | 0.79 |
| 2.299645822427724 | 1.118 | 0.828 | 0.79 |
| 2.302787415081314 | 1.119 | 0.831 | 0.791 |
| 2.305929007734904 | 1.12 | 0.834 | 0.791 |
| 2.309070600388493 | 1.121 | 0.837 | 0.791 |
| 2.312212193042083 | 1.122 | 0.84 | 0.792 |
| 2.315353785695672 | 1.123 | 0.843 | 0.792 |
| 2.318495378349262 | 1.123 | 0.846 | 0.793 |
| 2.321636971002852 | 1.124 | 0.849 | 0.793 |
| 2.324778563656441 | 1.125 | 0.852 | 0.794 |
| 2.327920156310031 | 1.126 | 0.855 | 0.794 |
| 2.33106174896362 | 1.127 | 0.858 | 0.795 |
| 2.33420334161721 | 1.128 | 0.862 | 0.795 |
| 2.3373449342708 | 1.129 | 0.865 | 0.796 |
| 2.340486526924389 | 1.13 | 0.868 | 0.797 |
| 2.343628119577979 | 1.13 | 0.871 | 0.797 |
| 2.346769712231568 | 1.131 | 0.874 | 0.798 |
| 2.349911304885158 | 1.132 | 0.877 | 0.799 |
| 2.353052897538748 | 1.133 | 0.88 | 0.799 |
| 2.356194490192337 | 1.134 | 0.884 | 0.8 |
| 2.359336082845927 | 1.134 | 0.887 | 0.801 |
| 2.362477675499516 | 1.135 | 0.89 | 0.802 |
| 2.365619268153106 | 1.136 | 0.893 | 0.803 |
| 2.368760860806696 | 1.137 | 0.896 | 0.804 |
| 2.371902453460285 | 1.137 | 0.899 | 0.805 |
| 2.375044046113875 | 1.138 | 0.902 | 0.806 |
| 2.378185638767464 | 1.139 | 0.906 | 0.806 |
| 2.381327231421054 | 1.14 | 0.909 | 0.808 |
| 2.384468824074644 | 1.14 | 0.912 | 0.809 |
| 2.387610416728233 | 1.141 | 0.915 | 0.81 |
| 2.390752009381823 | 1.142 | 0.918 | 0.811 |
| 2.393893602035412 | 1.142 | 0.921 | 0.812 |
| 2.397035194689002 | 1.143 | 0.924 | 0.813 |
| 2.400176787342591 | 1.144 | 0.927 | 0.814 |
| 2.403318379996181 | 1.144 | 0.93 | 0.816 |
| 2.406459972649771 | 1.145 | 0.934 | 0.817 |
| 2.40960156530336 | 1.146 | 0.937 | 0.818 |
| 2.41274315795695 | 1.146 | 0.94 | 0.82 |
| 2.41588475061054 | 1.147 | 0.943 | 0.821 |
| 2.419026343264129 | 1.147 | 0.946 | 0.823 |
| 2.422167935917719 | 1.148 | 0.949 | 0.824 |
| 2.425309528571308 | 1.149 | 0.952 | 0.826 |
| 2.428451121224898 | 1.149 | 0.955 | 0.827 |
| 2.431592713878488 | 1.15 | 0.958 | 0.829 |
| 2.434734306532077 | 1.15 | 0.961 | 0.83 |
| 2.437875899185667 | 1.151 | 0.964 | 0.832 |
| 2.441017491839256 | 1.151 | 0.967 | 0.834 |
| 2.444159084492846 | 1.152 | 0.97 | 0.836 |
| 2.447300677146435 | 1.152 | 0.973 | 0.837 |
| 2.450442269800025 | 1.153 | 0.976 | 0.839 |
| 2.453583862453615 | 1.153 | 0.979 | 0.841 |
| 2.456725455107204 | 1.154 | 0.981 | 0.843 |
| 2.459867047760794 | 1.155 | 0.984 | 0.845 |
| 2.463008640414384 | 1.155 | 0.987 | 0.847 |
| 2.466150233067973 | 1.155 | 0.99 | 0.849 |
| 2.469291825721563 | 1.156 | 0.993 | 0.851 |
| 2.472433418375152 | 1.156 | 0.996 | 0.853 |
| 2.475575011028742 | 1.157 | 0.999 | 0.855 |
| 2.478716603682332 | 1.157 | 1.001 | 0.857 |
| 2.481858196335921 | 1.158 | 1.004 | 0.86 |
| 2.48499978898951 | 1.158 | 1.007 | 0.862 |
| 2.4881413816431 | 1.159 | 1.01 | 0.864 |
| 2.49128297429669 | 1.159 | 1.012 | 0.866 |
| 2.49442456695028 | 1.16 | 1.015 | 0.869 |
| 2.497566159603869 | 1.16 | 1.018 | 0.871 |
| 2.500707752257458 | 1.16 | 1.02 | 0.874 |
| 2.503849344911048 | 1.161 | 1.023 | 0.876 |
| 2.506990937564638 | 1.161 | 1.026 | 0.879 |
| 2.510132530218228 | 1.161 | 1.028 | 0.881 |
| 2.513274122871817 | 1.162 | 1.031 | 0.884 |
| 2.516415715525407 | 1.162 | 1.033 | 0.886 |
| 2.519557308178996 | 1.163 | 1.036 | 0.889 |
| 2.522698900832586 | 1.163 | 1.038 | 0.891 |
| 2.525840493486176 | 1.163 | 1.041 | 0.894 |
| 2.528982086139765 | 1.164 | 1.043 | 0.897 |
| 2.532123678793355 | 1.164 | 1.046 | 0.9 |
| 2.535265271446944 | 1.164 | 1.048 | 0.902 |
| 2.538406864100534 | 1.165 | 1.051 | 0.905 |
| 2.541548456754124 | 1.165 | 1.053 | 0.908 |
| 2.544690049407713 | 1.165 | 1.055 | 0.911 |
| 2.547831642061302 | 1.166 | 1.058 | 0.914 |
| 2.550973234714892 | 1.166 | 1.06 | 0.916 |
| 2.554114827368482 | 1.166 | 1.062 | 0.919 |
| 2.557256420022072 | 1.167 | 1.065 | 0.922 |
| 2.560398012675661 | 1.167 | 1.067 | 0.925 |
| 2.563539605329251 | 1.167 | 1.069 | 0.928 |
| 2.56668119798284 | 1.167 | 1.071 | 0.931 |
| 2.56982279063643 | 1.168 | 1.073 | 0.934 |
| 2.57296438329002 | 1.168 | 1.076 | 0.937 |
| 2.576105975943609 | 1.168 | 1.078 | 0.94 |
| 2.579247568597199 | 1.168 | 1.08 | 0.943 |
| 2.582389161250788 | 1.169 | 1.082 | 0.946 |
| 2.585530753904377 | 1.169 | 1.084 | 0.949 |
| 2.588672346557967 | 1.169 | 1.086 | 0.953 |
| 2.591813939211557 | 1.169 | 1.088 | 0.956 |
| 2.594955531865147 | 1.17 | 1.09 | 0.959 |
| 2.598097124518736 | 1.17 | 1.092 | 0.962 |
| 2.601238717172326 | 1.17 | 1.094 | 0.965 |
| 2.604380309825915 | 1.17 | 1.096 | 0.968 |
| 2.607521902479505 | 1.171 | 1.097 | 0.971 |
| 2.610663495133095 | 1.171 | 1.099 | 0.974 |
| 2.613805087786684 | 1.171 | 1.101 | 0.978 |
| 2.616946680440274 | 1.171 | 1.103 | 0.981 |
| 2.620088273093863 | 1.171 | 1.105 | 0.984 |
| 2.623229865747452 | 1.172 | 1.106 | 0.987 |
| 2.626371458401042 | 1.172 | 1.108 | 0.99 |
| 2.629513051054632 | 1.172 | 1.11 | 0.993 |
| 2.632654643708222 | 1.172 | 1.112 | 0.996 |
| 2.635796236361811 | 1.172 | 1.113 | 1 |
| 2.638937829015401 | 1.172 | 1.115 | 1.003 |
| 2.642079421668991 | 1.173 | 1.116 | 1.006 |
| 2.64522101432258 | 1.173 | 1.118 | 1.009 |
| 2.64836260697617 | 1.173 | 1.119 | 1.012 |
| 2.651504199629759 | 1.173 | 1.121 | 1.015 |
| 2.654645792283349 | 1.173 | 1.122 | 1.018 |
| 2.657787384936938 | 1.173 | 1.124 | 1.021 |
| 2.660928977590528 | 1.174 | 1.125 | 1.024 |
| 2.664070570244118 | 1.174 | 1.127 | 1.027 |
| 2.667212162897707 | 1.174 | 1.128 | 1.03 |
| 2.670353755551297 | 1.174 | 1.129 | 1.033 |
| 2.673495348204887 | 1.174 | 1.131 | 1.036 |
| 2.676636940858476 | 1.174 | 1.132 | 1.039 |
| 2.679778533512066 | 1.174 | 1.133 | 1.042 |
| 2.682920126165655 | 1.174 | 1.135 | 1.045 |
| 2.686061718819245 | 1.175 | 1.136 | 1.048 |
| 2.689203311472835 | 1.175 | 1.137 | 1.051 |
| 2.692344904126424 | 1.175 | 1.138 | 1.054 |
| 2.695486496780014 | 1.175 | 1.139 | 1.057 |
| 2.698628089433603 | 1.175 | 1.141 | 1.059 |
| 2.701769682087193 | 1.175 | 1.142 | 1.062 |
| 2.704911274740782 | 1.175 | 1.143 | 1.065 |
| 2.708052867394372 | 1.175 | 1.144 | 1.068 |
| 2.711194460047962 | 1.175 | 1.145 | 1.07 |
| 2.714336052701551 | 1.175 | 1.146 | 1.073 |
| 2.717477645355141 | 1.176 | 1.147 | 1.076 |
| 2.720619238008731 | 1.176 | 1.148 | 1.078 |
| 2.72376083066232 | 1.176 | 1.149 | 1.081 |
| 2.72690242331591 | 1.176 | 1.15 | 1.083 |
| 2.730044015969499 | 1.176 | 1.151 | 1.086 |
| 2.733185608623089 | 1.176 | 1.152 | 1.088 |
| 2.736327201276678 | 1.176 | 1.153 | 1.091 |
| 2.739468793930268 | 1.176 | 1.153 | 1.093 |
| 2.742610386583858 | 1.176 | 1.154 | 1.096 |
| 2.745751979237447 | 1.176 | 1.155 | 1.098 |
| 2.748893571891036 | 1.176 | 1.156 | 1.1 |
| 2.752035164544627 | 1.176 | 1.157 | 1.102 |
| 2.755176757198216 | 1.176 | 1.157 | 1.105 |
| 2.758318349851806 | 1.177 | 1.158 | 1.107 |
| 2.761459942505395 | 1.177 | 1.159 | 1.109 |
| 2.764601535158985 | 1.177 | 1.16 | 1.111 |
| 2.767743127812574 | 1.177 | 1.16 | 1.113 |
| 2.770884720466164 | 1.177 | 1.161 | 1.115 |
| 2.774026313119754 | 1.177 | 1.162 | 1.117 |
| 2.777167905773343 | 1.177 | 1.162 | 1.119 |
| 2.780309498426932 | 1.177 | 1.163 | 1.121 |
| 2.783451091080522 | 1.177 | 1.163 | 1.123 |
| 2.786592683734112 | 1.177 | 1.164 | 1.125 |
| 2.789734276387701 | 1.177 | 1.164 | 1.127 |
| 2.792875869041291 | 1.177 | 1.165 | 1.129 |
| 2.796017461694881 | 1.177 | 1.166 | 1.13 |
| 2.79915905434847 | 1.177 | 1.166 | 1.132 |
| 2.80230064700206 | 1.177 | 1.167 | 1.134 |
| 2.80544223965565 | 1.177 | 1.167 | 1.135 |
| 2.808583832309239 | 1.177 | 1.167 | 1.137 |
| 2.811725424962829 | 1.177 | 1.168 | 1.138 |
| 2.814867017616419 | 1.177 | 1.168 | 1.14 |
| 2.818008610270008 | 1.177 | 1.169 | 1.141 |
| 2.821150202923598 | 1.177 | 1.169 | 1.143 |
| 2.824291795577187 | 1.177 | 1.17 | 1.144 |
| 2.827433388230777 | 1.178 | 1.17 | 1.146 |
| 2.830574980884366 | 1.178 | 1.17 | 1.147 |
| 2.833716573537956 | 1.178 | 1.171 | 1.148 |
| 2.836858166191546 | 1.178 | 1.171 | 1.15 |
| 2.839999758845135 | 1.178 | 1.171 | 1.151 |
| 2.843141351498725 | 1.178 | 1.172 | 1.152 |
| 2.846282944152314 | 1.178 | 1.172 | 1.153 |
| 2.849424536805904 | 1.178 | 1.172 | 1.154 |
| 2.852566129459494 | 1.178 | 1.173 | 1.155 |
| 2.855707722113083 | 1.178 | 1.173 | 1.156 |
| 2.858849314766673 | 1.178 | 1.173 | 1.157 |
| 2.861990907420262 | 1.178 | 1.173 | 1.158 |
| 2.865132500073852 | 1.178 | 1.174 | 1.159 |
| 2.868274092727442 | 1.178 | 1.174 | 1.16 |
| 2.871415685381031 | 1.178 | 1.174 | 1.161 |
| 2.874557278034621 | 1.178 | 1.174 | 1.162 |
| 2.87769887068821 | 1.178 | 1.175 | 1.163 |
| 2.8808404633418 | 1.178 | 1.175 | 1.164 |
| 2.88398205599539 | 1.178 | 1.175 | 1.164 |
| 2.88712364864898 | 1.178 | 1.175 | 1.165 |
| 2.890265241302569 | 1.178 | 1.175 | 1.166 |
| 2.893406833956158 | 1.178 | 1.175 | 1.166 |
| 2.896548426609748 | 1.178 | 1.176 | 1.167 |
| 2.899690019263338 | 1.178 | 1.176 | 1.168 |
| 2.902831611916927 | 1.178 | 1.176 | 1.168 |
| 2.905973204570517 | 1.178 | 1.176 | 1.169 |
| 2.909114797224106 | 1.178 | 1.176 | 1.169 |
| 2.912256389877696 | 1.178 | 1.176 | 1.17 |
| 2.915397982531286 | 1.178 | 1.176 | 1.17 |
| 2.918539575184875 | 1.178 | 1.176 | 1.171 |
| 2.921681167838465 | 1.178 | 1.177 | 1.171 |
| 2.924822760492054 | 1.178 | 1.177 | 1.172 |
| 2.927964353145644 | 1.178 | 1.177 | 1.172 |
| 2.931105945799234 | 1.178 | 1.177 | 1.173 |
| 2.934247538452823 | 1.178 | 1.177 | 1.173 |
| 2.937389131106413 | 1.178 | 1.177 | 1.173 |
| 2.940530723760002 | 1.178 | 1.177 | 1.174 |
| 2.943672316413592 | 1.178 | 1.177 | 1.174 |
| 2.946813909067182 | 1.178 | 1.177 | 1.174 |
| 2.949955501720771 | 1.178 | 1.177 | 1.175 |
| 2.953097094374361 | 1.178 | 1.177 | 1.175 |
| 2.95623868702795 | 1.178 | 1.177 | 1.175 |
| 2.95938027968154 | 1.178 | 1.177 | 1.175 |
| 2.96252187233513 | 1.178 | 1.178 | 1.175 |
| 2.965663464988719 | 1.178 | 1.178 | 1.176 |
| 2.968805057642309 | 1.178 | 1.178 | 1.176 |
| 2.971946650295898 | 1.178 | 1.178 | 1.176 |
| 2.975088242949488 | 1.178 | 1.178 | 1.176 |
| 2.978229835603078 | 1.178 | 1.178 | 1.176 |
| 2.981371428256667 | 1.178 | 1.178 | 1.177 |
| 2.984513020910257 | 1.178 | 1.178 | 1.177 |
| 2.987654613563846 | 1.178 | 1.178 | 1.177 |
| 2.990796206217436 | 1.178 | 1.178 | 1.177 |
| 2.993937798871025 | 1.178 | 1.178 | 1.177 |
| 2.997079391524615 | 1.178 | 1.178 | 1.177 |
| 3.000220984178205 | 1.178 | 1.178 | 1.177 |
| 3.003362576831794 | 1.178 | 1.178 | 1.177 |
| 3.006504169485384 | 1.178 | 1.178 | 1.177 |
| 3.009645762138974 | 1.178 | 1.178 | 1.177 |
| 3.012787354792563 | 1.178 | 1.178 | 1.178 |
| 3.015928947446153 | 1.178 | 1.178 | 1.178 |
| 3.019070540099742 | 1.178 | 1.178 | 1.178 |
| 3.022212132753332 | 1.178 | 1.178 | 1.178 |
| 3.025353725406922 | 1.178 | 1.178 | 1.178 |
| 3.028495318060511 | 1.178 | 1.178 | 1.178 |
| 3.031636910714101 | 1.178 | 1.178 | 1.178 |
| 3.03477850336769 | 1.178 | 1.178 | 1.178 |
| 3.03792009602128 | 1.178 | 1.178 | 1.178 |
| 3.04106168867487 | 1.178 | 1.178 | 1.178 |
| 3.04420328132846 | 1.178 | 1.178 | 1.178 |
| 3.047344873982049 | 1.178 | 1.178 | 1.178 |
| 3.050486466635638 | 1.178 | 1.178 | 1.178 |
| 3.053628059289228 | 1.178 | 1.178 | 1.178 |
| 3.056769651942818 | 1.178 | 1.178 | 1.178 |
| 3.059911244596407 | 1.178 | 1.178 | 1.178 |
| 3.063052837249997 | 1.178 | 1.178 | 1.178 |
| 3.066194429903586 | 1.178 | 1.178 | 1.178 |
| 3.069336022557176 | 1.178 | 1.178 | 1.178 |
| 3.072477615210766 | 1.178 | 1.178 | 1.178 |
| 3.075619207864355 | 1.178 | 1.178 | 1.178 |
| 3.078760800517945 | 1.178 | 1.178 | 1.178 |
| 3.081902393171534 | 1.178 | 1.178 | 1.178 |
| 3.085043985825124 | 1.178 | 1.178 | 1.178 |
| 3.088185578478713 | 1.178 | 1.178 | 1.178 |
| 3.091327171132303 | 1.178 | 1.178 | 1.178 |
| 3.094468763785893 | 1.178 | 1.178 | 1.178 |
| 3.097610356439482 | 1.178 | 1.178 | 1.178 |
| 3.100751949093072 | 1.178 | 1.178 | 1.178 |
| 3.103893541746661 | 1.178 | 1.178 | 1.178 |
| 3.107035134400251 | 1.178 | 1.178 | 1.178 |
| 3.110176727053841 | 1.178 | 1.178 | 1.178 |
| 3.11331831970743 | 1.178 | 1.178 | 1.178 |
| 3.11645991236102 | 1.178 | 1.178 | 1.178 |
| 3.11960150501461 | 1.178 | 1.178 | 1.178 |
| 3.122743097668199 | 1.178 | 1.178 | 1.178 |
| 3.125884690321789 | 1.178 | 1.178 | 1.178 |
| 3.129026282975378 | 1.178 | 1.178 | 1.178 |
| 3.132167875628968 | 1.178 | 1.178 | 1.178 |
| 3.135309468282557 | 1.178 | 1.178 | 1.178 |
| 3.138451060936147 | 1.178 | 1.178 | 1.178 |
| 3.141592653589737 | 1.178 | 1.178 | 1.178 |
| 3.144734246243326 | 1.178 | 1.178 | 1.178 |
| 3.147875838896916 | 1.178 | 1.178 | 1.178 |
| 3.151017431550505 | 1.178 | 1.178 | 1.178 |
| 3.154159024204095 | 1.178 | 1.178 | 1.178 |
| 3.157300616857685 | 1.178 | 1.178 | 1.178 |
| 3.160442209511274 | 1.178 | 1.178 | 1.178 |
| 3.163583802164864 | 1.178 | 1.178 | 1.178 |
| 3.166725394818453 | 1.178 | 1.178 | 1.178 |
| 3.169866987472043 | 1.178 | 1.178 | 1.178 |
| 3.173008580125633 | 1.178 | 1.178 | 1.178 |
| 3.176150172779222 | 1.178 | 1.178 | 1.178 |
| 3.179291765432812 | 1.178 | 1.178 | 1.178 |
| 3.182433358086401 | 1.178 | 1.178 | 1.178 |
| 3.185574950739991 | 1.178 | 1.178 | 1.178 |
| 3.188716543393581 | 1.178 | 1.178 | 1.178 |
| 3.19185813604717 | 1.178 | 1.178 | 1.178 |
| 3.19499972870076 | 1.178 | 1.178 | 1.178 |
| 3.198141321354349 | 1.178 | 1.178 | 1.178 |
| 3.20128291400794 | 1.178 | 1.178 | 1.178 |
| 3.204424506661528 | 1.178 | 1.178 | 1.178 |
| 3.207566099315118 | 1.178 | 1.178 | 1.178 |
| 3.210707691968708 | 1.178 | 1.178 | 1.178 |
| 3.213849284622297 | 1.178 | 1.178 | 1.178 |
| 3.216990877275887 | 1.178 | 1.178 | 1.178 |
| 3.220132469929476 | 1.178 | 1.178 | 1.178 |
| 3.223274062583066 | 1.178 | 1.178 | 1.178 |
| 3.226415655236656 | 1.178 | 1.178 | 1.178 |
| 3.229557247890245 | 1.178 | 1.178 | 1.178 |
| 3.232698840543835 | 1.178 | 1.178 | 1.178 |
| 3.235840433197425 | 1.178 | 1.178 | 1.178 |
| 3.238982025851014 | 1.178 | 1.178 | 1.178 |
| 3.242123618504604 | 1.178 | 1.178 | 1.178 |
| 3.245265211158193 | 1.178 | 1.178 | 1.178 |
| 3.248406803811783 | 1.178 | 1.178 | 1.178 |
| 3.251548396465373 | 1.178 | 1.178 | 1.178 |
| 3.254689989118962 | 1.178 | 1.178 | 1.178 |
| 3.257831581772551 | 1.178 | 1.178 | 1.178 |
| 3.260973174426141 | 1.178 | 1.178 | 1.178 |
| 3.26411476707973 | 1.178 | 1.178 | 1.179 |
| 3.267256359733321 | 1.178 | 1.178 | 1.179 |
| 3.27039795238691 | 1.178 | 1.178 | 1.179 |
| 3.2735395450405 | 1.178 | 1.178 | 1.179 |
| 3.276681137694089 | 1.178 | 1.178 | 1.179 |
| 3.279822730347679 | 1.178 | 1.178 | 1.179 |
| 3.282964323001269 | 1.178 | 1.178 | 1.179 |
| 3.286105915654858 | 1.178 | 1.178 | 1.179 |
| 3.289247508308448 | 1.178 | 1.178 | 1.179 |
| 3.292389100962037 | 1.178 | 1.178 | 1.179 |
| 3.295530693615627 | 1.178 | 1.178 | 1.179 |
| 3.298672286269217 | 1.178 | 1.178 | 1.179 |
| 3.301813878922806 | 1.178 | 1.178 | 1.18 |
| 3.304955471576396 | 1.178 | 1.178 | 1.18 |
| 3.308097064229985 | 1.178 | 1.178 | 1.18 |
| 3.311238656883575 | 1.178 | 1.179 | 1.18 |
| 3.314380249537165 | 1.178 | 1.179 | 1.18 |
| 3.317521842190754 | 1.178 | 1.179 | 1.18 |
| 3.320663434844344 | 1.178 | 1.179 | 1.181 |
| 3.323805027497933 | 1.178 | 1.179 | 1.181 |
| 3.326946620151523 | 1.178 | 1.179 | 1.181 |
| 3.330088212805113 | 1.178 | 1.179 | 1.181 |
| 3.333229805458702 | 1.178 | 1.179 | 1.182 |
| 3.336371398112292 | 1.178 | 1.179 | 1.182 |
| 3.339512990765881 | 1.178 | 1.179 | 1.182 |
| 3.342654583419471 | 1.178 | 1.179 | 1.183 |
| 3.345796176073061 | 1.178 | 1.179 | 1.183 |
| 3.34893776872665 | 1.178 | 1.179 | 1.183 |
| 3.35207936138024 | 1.178 | 1.179 | 1.184 |
| 3.355220954033829 | 1.178 | 1.179 | 1.184 |
| 3.358362546687419 | 1.178 | 1.179 | 1.184 |
| 3.361504139341009 | 1.178 | 1.18 | 1.185 |
| 3.364645731994598 | 1.178 | 1.18 | 1.185 |
| 3.367787324648188 | 1.178 | 1.18 | 1.186 |
| 3.370928917301777 | 1.178 | 1.18 | 1.186 |
| 3.374070509955367 | 1.178 | 1.18 | 1.187 |
| 3.377212102608956 | 1.178 | 1.18 | 1.187 |
| 3.380353695262546 | 1.178 | 1.18 | 1.188 |
| 3.383495287916136 | 1.178 | 1.18 | 1.189 |
| 3.386636880569725 | 1.178 | 1.181 | 1.189 |
| 3.389778473223315 | 1.178 | 1.181 | 1.19 |
| 3.392920065876904 | 1.178 | 1.181 | 1.19 |
| 3.396061658530494 | 1.178 | 1.181 | 1.191 |
| 3.399203251184084 | 1.178 | 1.181 | 1.192 |
| 3.402344843837673 | 1.178 | 1.181 | 1.193 |
| 3.405486436491263 | 1.178 | 1.182 | 1.193 |
| 3.408628029144852 | 1.178 | 1.182 | 1.194 |
| 3.411769621798442 | 1.178 | 1.182 | 1.195 |
| 3.414911214452032 | 1.178 | 1.182 | 1.196 |
| 3.418052807105621 | 1.178 | 1.183 | 1.197 |
| 3.421194399759211 | 1.178 | 1.183 | 1.198 |
| 3.4243359924128 | 1.178 | 1.183 | 1.199 |
| 3.42747758506639 | 1.178 | 1.183 | 1.2 |
| 3.43061917771998 | 1.178 | 1.184 | 1.201 |
| 3.433760770373569 | 1.179 | 1.184 | 1.202 |
| 3.436902363027159 | 1.179 | 1.184 | 1.203 |
| 3.440043955680748 | 1.179 | 1.184 | 1.204 |
| 3.443185548334338 | 1.179 | 1.185 | 1.205 |
| 3.446327140987927 | 1.179 | 1.185 | 1.207 |
| 3.449468733641517 | 1.179 | 1.185 | 1.208 |
| 3.452610326295107 | 1.179 | 1.186 | 1.209 |
| 3.455751918948696 | 1.179 | 1.186 | 1.211 |
| 3.458893511602286 | 1.179 | 1.187 | 1.212 |
| 3.462035104255876 | 1.179 | 1.187 | 1.213 |
| 3.465176696909465 | 1.179 | 1.187 | 1.215 |
| 3.468318289563055 | 1.179 | 1.188 | 1.216 |
| 3.471459882216644 | 1.179 | 1.188 | 1.218 |
| 3.474601474870234 | 1.179 | 1.189 | 1.219 |
| 3.477743067523824 | 1.179 | 1.189 | 1.221 |
| 3.480884660177413 | 1.179 | 1.19 | 1.222 |
| 3.484026252831002 | 1.179 | 1.19 | 1.224 |
| 3.487167845484592 | 1.179 | 1.191 | 1.226 |
| 3.490309438138182 | 1.179 | 1.191 | 1.228 |
| 3.493451030791772 | 1.179 | 1.192 | 1.229 |
| 3.496592623445361 | 1.179 | 1.192 | 1.231 |
| 3.499734216098951 | 1.179 | 1.193 | 1.233 |
| 3.50287580875254 | 1.179 | 1.193 | 1.235 |
| 3.50601740140613 | 1.179 | 1.194 | 1.237 |
| 3.50915899405972 | 1.179 | 1.195 | 1.239 |
| 3.512300586713309 | 1.179 | 1.195 | 1.241 |
| 3.515442179366899 | 1.179 | 1.196 | 1.243 |
| 3.518583772020488 | 1.18 | 1.197 | 1.245 |
| 3.521725364674078 | 1.18 | 1.197 | 1.247 |
| 3.524866957327668 | 1.18 | 1.198 | 1.249 |
| 3.528008549981257 | 1.18 | 1.199 | 1.252 |
| 3.531150142634847 | 1.18 | 1.2 | 1.254 |
| 3.534291735288436 | 1.18 | 1.2 | 1.256 |
| 3.537433327942026 | 1.18 | 1.201 | 1.258 |
| 3.540574920595616 | 1.18 | 1.202 | 1.261 |
| 3.543716513249205 | 1.18 | 1.203 | 1.263 |
| 3.546858105902795 | 1.18 | 1.204 | 1.265 |
| 3.549999698556384 | 1.18 | 1.205 | 1.268 |
| 3.553141291209974 | 1.18 | 1.205 | 1.27 |
| 3.556282883863564 | 1.18 | 1.206 | 1.273 |
| 3.559424476517153 | 1.18 | 1.207 | 1.275 |
| 3.562566069170743 | 1.181 | 1.208 | 1.278 |
| 3.565707661824332 | 1.181 | 1.209 | 1.281 |
| 3.568849254477922 | 1.181 | 1.21 | 1.283 |
| 3.571990847131511 | 1.181 | 1.211 | 1.286 |
| 3.575132439785101 | 1.181 | 1.212 | 1.289 |
| 3.578274032438691 | 1.181 | 1.213 | 1.291 |
| 3.58141562509228 | 1.181 | 1.214 | 1.294 |
| 3.58455721774587 | 1.181 | 1.216 | 1.297 |
| 3.58769881039946 | 1.181 | 1.217 | 1.3 |
| 3.590840403053049 | 1.181 | 1.218 | 1.303 |
| 3.593981995706639 | 1.182 | 1.219 | 1.305 |
| 3.597123588360228 | 1.182 | 1.22 | 1.308 |
| 3.600265181013818 | 1.182 | 1.222 | 1.311 |
| 3.603406773667407 | 1.182 | 1.223 | 1.314 |
| 3.606548366320997 | 1.182 | 1.224 | 1.317 |
| 3.609689958974587 | 1.182 | 1.225 | 1.32 |
| 3.612831551628176 | 1.182 | 1.227 | 1.323 |
| 3.615973144281766 | 1.182 | 1.228 | 1.326 |
| 3.619114736935355 | 1.183 | 1.229 | 1.329 |
| 3.622256329588945 | 1.183 | 1.231 | 1.332 |
| 3.625397922242534 | 1.183 | 1.232 | 1.335 |
| 3.628539514896124 | 1.183 | 1.234 | 1.338 |
| 3.631681107549714 | 1.183 | 1.235 | 1.341 |
| 3.634822700203303 | 1.183 | 1.237 | 1.344 |
| 3.637964292856893 | 1.183 | 1.238 | 1.347 |
| 3.641105885510483 | 1.184 | 1.24 | 1.35 |
| 3.644247478164072 | 1.184 | 1.241 | 1.354 |
| 3.647389070817662 | 1.184 | 1.243 | 1.357 |
| 3.650530663471251 | 1.184 | 1.245 | 1.36 |
| 3.653672256124841 | 1.184 | 1.246 | 1.363 |
| 3.656813848778431 | 1.184 | 1.248 | 1.366 |
| 3.65995544143202 | 1.185 | 1.25 | 1.369 |
| 3.66309703408561 | 1.185 | 1.251 | 1.372 |
| 3.666238626739199 | 1.185 | 1.253 | 1.375 |
| 3.66938021939279 | 1.185 | 1.255 | 1.379 |
| 3.672521812046378 | 1.185 | 1.257 | 1.382 |
| 3.675663404699968 | 1.186 | 1.259 | 1.385 |
| 3.678804997353558 | 1.186 | 1.261 | 1.388 |
| 3.681946590007147 | 1.186 | 1.262 | 1.391 |
| 3.685088182660737 | 1.186 | 1.264 | 1.394 |
| 3.688229775314326 | 1.187 | 1.266 | 1.397 |
| 3.691371367967916 | 1.187 | 1.268 | 1.401 |
| 3.694512960621506 | 1.187 | 1.27 | 1.404 |
| 3.697654553275095 | 1.187 | 1.272 | 1.407 |
| 3.700796145928685 | 1.188 | 1.274 | 1.41 |
| 3.703937738582274 | 1.188 | 1.276 | 1.413 |
| 3.707079331235864 | 1.188 | 1.278 | 1.416 |
| 3.710220923889454 | 1.188 | 1.281 | 1.419 |
| 3.713362516543043 | 1.189 | 1.283 | 1.422 |
| 3.716504109196633 | 1.189 | 1.285 | 1.425 |
| 3.719645701850223 | 1.189 | 1.287 | 1.428 |
| 3.722787294503812 | 1.189 | 1.289 | 1.431 |
| 3.725928887157402 | 1.19 | 1.292 | 1.434 |
| 3.729070479810991 | 1.19 | 1.294 | 1.437 |
| 3.732212072464581 | 1.19 | 1.296 | 1.44 |
| 3.735353665118171 | 1.191 | 1.298 | 1.443 |
| 3.73849525777176 | 1.191 | 1.301 | 1.445 |
| 3.74163685042535 | 1.191 | 1.303 | 1.448 |
| 3.744778443078939 | 1.192 | 1.306 | 1.451 |
| 3.747920035732529 | 1.192 | 1.308 | 1.454 |
| 3.751061628386119 | 1.192 | 1.31 | 1.457 |
| 3.754203221039708 | 1.193 | 1.313 | 1.459 |
| 3.757344813693298 | 1.193 | 1.315 | 1.462 |
| 3.760486406346887 | 1.193 | 1.318 | 1.465 |
| 3.763627999000477 | 1.194 | 1.32 | 1.467 |
| 3.766769591654067 | 1.194 | 1.323 | 1.47 |
| 3.769911184307656 | 1.194 | 1.325 | 1.473 |
| 3.773052776961246 | 1.195 | 1.328 | 1.475 |
| 3.776194369614835 | 1.195 | 1.331 | 1.478 |
| 3.779335962268425 | 1.195 | 1.333 | 1.48 |
| 3.782477554922014 | 1.196 | 1.336 | 1.483 |
| 3.785619147575604 | 1.196 | 1.338 | 1.485 |
| 3.788760740229193 | 1.197 | 1.341 | 1.487 |
| 3.791902332882783 | 1.197 | 1.344 | 1.49 |
| 3.795043925536373 | 1.198 | 1.347 | 1.492 |
| 3.798185518189962 | 1.198 | 1.349 | 1.494 |
| 3.801327110843552 | 1.198 | 1.352 | 1.497 |
| 3.804468703497142 | 1.199 | 1.355 | 1.499 |
| 3.807610296150731 | 1.199 | 1.358 | 1.501 |
| 3.810751888804321 | 1.2 | 1.36 | 1.503 |
| 3.813893481457911 | 1.2 | 1.363 | 1.505 |
| 3.8170350741115 | 1.201 | 1.366 | 1.507 |
| 3.82017666676509 | 1.201 | 1.369 | 1.509 |
| 3.823318259418679 | 1.202 | 1.372 | 1.511 |
| 3.826459852072269 | 1.202 | 1.375 | 1.513 |
| 3.829601444725859 | 1.203 | 1.378 | 1.515 |
| 3.832743037379448 | 1.203 | 1.381 | 1.517 |
| 3.835884630033038 | 1.204 | 1.383 | 1.519 |
| 3.839026222686627 | 1.204 | 1.386 | 1.521 |
| 3.842167815340217 | 1.205 | 1.389 | 1.522 |
| 3.845309407993807 | 1.205 | 1.392 | 1.524 |
| 3.848451000647396 | 1.206 | 1.395 | 1.526 |
| 3.851592593300986 | 1.206 | 1.398 | 1.527 |
| 3.854734185954575 | 1.207 | 1.401 | 1.529 |
| 3.857875778608165 | 1.208 | 1.404 | 1.531 |
| 3.861017371261755 | 1.208 | 1.407 | 1.532 |
| 3.864158963915344 | 1.209 | 1.41 | 1.534 |
| 3.867300556568933 | 1.209 | 1.413 | 1.535 |
| 3.870442149222523 | 1.21 | 1.417 | 1.537 |
| 3.873583741876112 | 1.211 | 1.42 | 1.538 |
| 3.876725334529703 | 1.211 | 1.423 | 1.539 |
| 3.879866927183292 | 1.212 | 1.426 | 1.541 |
| 3.883008519836882 | 1.213 | 1.429 | 1.542 |
| 3.886150112490471 | 1.213 | 1.432 | 1.543 |
| 3.889291705144061 | 1.214 | 1.435 | 1.544 |
| 3.892433297797651 | 1.215 | 1.438 | 1.545 |
| 3.89557489045124 | 1.215 | 1.441 | 1.547 |
| 3.89871648310483 | 1.216 | 1.444 | 1.548 |
| 3.901858075758419 | 1.217 | 1.448 | 1.549 |
| 3.904999668412009 | 1.217 | 1.451 | 1.55 |
| 3.908141261065598 | 1.218 | 1.454 | 1.551 |
| 3.911282853719188 | 1.219 | 1.457 | 1.552 |
| 3.914424446372778 | 1.22 | 1.46 | 1.553 |
| 3.917566039026367 | 1.22 | 1.463 | 1.553 |
| 3.920707631679957 | 1.221 | 1.466 | 1.554 |
| 3.923849224333547 | 1.222 | 1.469 | 1.555 |
| 3.926990816987136 | 1.223 | 1.473 | 1.556 |
| 3.930132409640726 | 1.223 | 1.476 | 1.557 |
| 3.933274002294315 | 1.224 | 1.479 | 1.557 |
| 3.936415594947905 | 1.225 | 1.482 | 1.558 |
| 3.939557187601495 | 1.226 | 1.485 | 1.559 |
| 3.942698780255084 | 1.227 | 1.488 | 1.56 |
| 3.945840372908674 | 1.228 | 1.491 | 1.56 |
| 3.948981965562263 | 1.228 | 1.495 | 1.561 |
| 3.952123558215853 | 1.229 | 1.498 | 1.561 |
| 3.955265150869442 | 1.23 | 1.501 | 1.562 |
| 3.958406743523032 | 1.231 | 1.504 | 1.562 |
| 3.961548336176622 | 1.232 | 1.507 | 1.563 |
| 3.964689928830211 | 1.233 | 1.51 | 1.563 |
| 3.967831521483801 | 1.234 | 1.513 | 1.564 |
| 3.97097311413739 | 1.235 | 1.516 | 1.564 |
| 3.97411470679098 | 1.236 | 1.519 | 1.565 |
| 3.97725629944457 | 1.236 | 1.523 | 1.565 |
| 3.98039789209816 | 1.237 | 1.526 | 1.566 |
| 3.983539484751749 | 1.238 | 1.529 | 1.566 |
| 3.986681077405338 | 1.239 | 1.532 | 1.566 |
| 3.989822670058928 | 1.24 | 1.535 | 1.567 |
| 3.992964262712517 | 1.241 | 1.538 | 1.567 |
| 3.996105855366107 | 1.242 | 1.541 | 1.567 |
| 3.999247448019697 | 1.243 | 1.544 | 1.567 |
| 4.002389040673287 | 1.244 | 1.547 | 1.568 |
| 4.005530633326877 | 1.245 | 1.55 | 1.568 |
| 4.008672225980466 | 1.247 | 1.553 | 1.568 |
| 4.011813818634056 | 1.248 | 1.556 | 1.568 |
| 4.014955411287645 | 1.249 | 1.559 | 1.569 |
| 4.018097003941234 | 1.25 | 1.562 | 1.569 |
| 4.021238596594824 | 1.251 | 1.565 | 1.569 |
| 4.024380189248414 | 1.252 | 1.568 | 1.569 |
| 4.027521781902004 | 1.253 | 1.57 | 1.569 |
| 4.030663374555593 | 1.254 | 1.573 | 1.569 |
| 4.033804967209183 | 1.255 | 1.576 | 1.569 |
| 4.036946559862773 | 1.257 | 1.579 | 1.57 |
| 4.040088152516362 | 1.258 | 1.582 | 1.57 |
| 4.043229745169951 | 1.259 | 1.585 | 1.57 |
| 4.046371337823541 | 1.26 | 1.588 | 1.57 |
| 4.049512930477131 | 1.261 | 1.59 | 1.57 |
| 4.05265452313072 | 1.263 | 1.593 | 1.57 |
| 4.05579611578431 | 1.264 | 1.596 | 1.57 |
| 4.0589377084379 | 1.265 | 1.599 | 1.57 |
| 4.062079301091489 | 1.266 | 1.601 | 1.57 |
| 4.065220893745079 | 1.268 | 1.604 | 1.57 |
| 4.068362486398668 | 1.269 | 1.607 | 1.57 |
| 4.071504079052258 | 1.27 | 1.609 | 1.57 |
| 4.074645671705848 | 1.271 | 1.612 | 1.57 |
| 4.077787264359437 | 1.273 | 1.615 | 1.571 |
| 4.080928857013027 | 1.274 | 1.617 | 1.571 |
| 4.084070449666616 | 1.275 | 1.62 | 1.571 |
| 4.087212042320206 | 1.277 | 1.622 | 1.571 |
| 4.090353634973795 | 1.278 | 1.625 | 1.571 |
| 4.093495227627385 | 1.279 | 1.627 | 1.571 |
| 4.096636820280975 | 1.281 | 1.63 | 1.571 |
| 4.099778412934564 | 1.282 | 1.632 | 1.571 |
| 4.102920005588154 | 1.284 | 1.635 | 1.571 |
| 4.106061598241744 | 1.285 | 1.637 | 1.571 |
| 4.109203190895333 | 1.287 | 1.64 | 1.571 |
| 4.112344783548923 | 1.288 | 1.642 | 1.571 |
| 4.115486376202512 | 1.289 | 1.644 | 1.571 |
| 4.118627968856102 | 1.291 | 1.647 | 1.571 |
| 4.121769561509692 | 1.292 | 1.649 | 1.571 |
| 4.124911154163281 | 1.294 | 1.651 | 1.571 |
| 4.128052746816871 | 1.295 | 1.654 | 1.571 |
| 4.13119433947046 | 1.297 | 1.656 | 1.571 |
| 4.13433593212405 | 1.299 | 1.658 | 1.571 |
| 4.13747752477764 | 1.3 | 1.66 | 1.571 |
| 4.14061911743123 | 1.302 | 1.662 | 1.571 |
| 4.143760710084818 | 1.303 | 1.665 | 1.571 |
| 4.146902302738408 | 1.305 | 1.667 | 1.571 |
| 4.150043895391998 | 1.306 | 1.669 | 1.571 |
| 4.153185488045588 | 1.308 | 1.671 | 1.571 |
| 4.156327080699177 | 1.31 | 1.673 | 1.571 |
| 4.159468673352766 | 1.311 | 1.675 | 1.571 |
| 4.162610266006356 | 1.313 | 1.677 | 1.571 |
| 4.165751858659946 | 1.315 | 1.679 | 1.571 |
| 4.168893451313535 | 1.316 | 1.681 | 1.571 |
| 4.172035043967125 | 1.318 | 1.683 | 1.571 |
| 4.175176636620715 | 1.32 | 1.685 | 1.571 |
| 4.178318229274304 | 1.321 | 1.687 | 1.571 |
| 4.181459821927894 | 1.323 | 1.688 | 1.571 |
| 4.184601414581484 | 1.325 | 1.69 | 1.571 |
| 4.187743007235073 | 1.327 | 1.692 | 1.571 |
| 4.190884599888663 | 1.328 | 1.694 | 1.571 |
| 4.194026192542252 | 1.33 | 1.695 | 1.571 |
| 4.197167785195842 | 1.332 | 1.697 | 1.571 |
| 4.200309377849432 | 1.334 | 1.699 | 1.571 |
| 4.203450970503021 | 1.336 | 1.701 | 1.571 |
| 4.206592563156611 | 1.337 | 1.702 | 1.571 |
| 4.2097341558102 | 1.339 | 1.704 | 1.571 |
| 4.21287574846379 | 1.341 | 1.705 | 1.571 |
| 4.21601734111738 | 1.343 | 1.707 | 1.571 |
| 4.21915893377097 | 1.345 | 1.708 | 1.571 |
| 4.222300526424559 | 1.347 | 1.71 | 1.571 |
| 4.225442119078148 | 1.349 | 1.711 | 1.571 |
| 4.228583711731738 | 1.351 | 1.713 | 1.571 |
| 4.231725304385327 | 1.353 | 1.714 | 1.571 |
| 4.234866897038917 | 1.355 | 1.716 | 1.571 |
| 4.238008489692506 | 1.356 | 1.717 | 1.571 |
| 4.241150082346096 | 1.358 | 1.718 | 1.571 |
| 4.244291674999685 | 1.36 | 1.72 | 1.571 |
| 4.247433267653276 | 1.362 | 1.721 | 1.571 |
| 4.250574860306865 | 1.364 | 1.722 | 1.571 |
| 4.253716452960455 | 1.366 | 1.724 | 1.571 |
| 4.256858045614044 | 1.369 | 1.725 | 1.571 |
| 4.259999638267634 | 1.371 | 1.726 | 1.571 |
| 4.263141230921224 | 1.373 | 1.727 | 1.571 |
| 4.266282823574813 | 1.375 | 1.728 | 1.571 |
| 4.269424416228403 | 1.377 | 1.73 | 1.571 |
| 4.272566008881992 | 1.379 | 1.731 | 1.571 |
| 4.275707601535582 | 1.381 | 1.732 | 1.571 |
| 4.27884919418917 | 1.383 | 1.733 | 1.571 |
| 4.28199078684276 | 1.385 | 1.734 | 1.571 |
| 4.285132379496351 | 1.387 | 1.735 | 1.571 |
| 4.28827397214994 | 1.39 | 1.736 | 1.571 |
| 4.29141556480353 | 1.392 | 1.737 | 1.571 |
| 4.294557157457119 | 1.394 | 1.738 | 1.571 |
| 4.29769875011071 | 1.396 | 1.739 | 1.571 |
| 4.300840342764299 | 1.398 | 1.74 | 1.571 |
| 4.303981935417888 | 1.401 | 1.741 | 1.571 |
| 4.307123528071478 | 1.403 | 1.742 | 1.571 |
| 4.310265120725067 | 1.405 | 1.742 | 1.571 |
| 4.313406713378657 | 1.407 | 1.743 | 1.571 |
| 4.316548306032247 | 1.41 | 1.744 | 1.571 |
| 4.319689898685836 | 1.412 | 1.745 | 1.571 |
| 4.322831491339426 | 1.414 | 1.746 | 1.571 |
| 4.325973083993015 | 1.416 | 1.746 | 1.572 |
| 4.329114676646605 | 1.419 | 1.747 | 1.572 |
| 4.332256269300195 | 1.421 | 1.748 | 1.572 |
| 4.335397861953784 | 1.423 | 1.749 | 1.572 |
| 4.338539454607374 | 1.426 | 1.749 | 1.572 |
| 4.341681047260963 | 1.428 | 1.75 | 1.572 |
| 4.344822639914553 | 1.431 | 1.751 | 1.572 |
| 4.347964232568143 | 1.433 | 1.751 | 1.572 |
| 4.351105825221732 | 1.435 | 1.752 | 1.572 |
| 4.354247417875322 | 1.438 | 1.752 | 1.573 |
| 4.357389010528911 | 1.44 | 1.753 | 1.573 |
| 4.360530603182501 | 1.443 | 1.754 | 1.573 |
| 4.36367219583609 | 1.445 | 1.754 | 1.573 |
| 4.36681378848968 | 1.448 | 1.755 | 1.573 |
| 4.36995538114327 | 1.45 | 1.755 | 1.574 |
| 4.373096973796859 | 1.452 | 1.756 | 1.574 |
| 4.376238566450449 | 1.455 | 1.756 | 1.574 |
| 4.379380159104038 | 1.457 | 1.757 | 1.574 |
| 4.382521751757628 | 1.46 | 1.757 | 1.575 |
| 4.385663344411217 | 1.462 | 1.757 | 1.575 |
| 4.388804937064807 | 1.465 | 1.758 | 1.575 |
| 4.391946529718397 | 1.468 | 1.758 | 1.575 |
| 4.395088122371987 | 1.47 | 1.759 | 1.576 |
| 4.398229715025576 | 1.473 | 1.759 | 1.576 |
| 4.401371307679165 | 1.475 | 1.759 | 1.577 |
| 4.404512900332755 | 1.478 | 1.76 | 1.577 |
| 4.407654492986345 | 1.48 | 1.76 | 1.577 |
| 4.410796085639934 | 1.483 | 1.76 | 1.578 |
| 4.413937678293524 | 1.486 | 1.761 | 1.578 |
| 4.417079270947114 | 1.488 | 1.761 | 1.579 |
| 4.420220863600703 | 1.491 | 1.761 | 1.579 |
| 4.423362456254293 | 1.494 | 1.762 | 1.58 |
| 4.426504048907883 | 1.496 | 1.762 | 1.58 |
| 4.429645641561472 | 1.499 | 1.762 | 1.581 |
| 4.432787234215062 | 1.502 | 1.762 | 1.582 |
| 4.435928826868651 | 1.504 | 1.763 | 1.582 |
| 4.43907041952224 | 1.507 | 1.763 | 1.583 |
| 4.44221201217583 | 1.51 | 1.763 | 1.584 |
| 4.44535360482942 | 1.512 | 1.763 | 1.584 |
| 4.44849519748301 | 1.515 | 1.764 | 1.585 |
| 4.4516367901366 | 1.518 | 1.764 | 1.586 |
| 4.454778382790188 | 1.521 | 1.764 | 1.587 |
| 4.457919975443779 | 1.523 | 1.764 | 1.588 |
| 4.461061568097368 | 1.526 | 1.764 | 1.588 |
| 4.464203160750958 | 1.529 | 1.764 | 1.589 |
| 4.467344753404547 | 1.532 | 1.765 | 1.59 |
| 4.470486346058137 | 1.534 | 1.765 | 1.591 |
| 4.473627938711726 | 1.537 | 1.765 | 1.592 |
| 4.476769531365316 | 1.54 | 1.765 | 1.593 |
| 4.479911124018905 | 1.543 | 1.765 | 1.594 |
| 4.483052716672495 | 1.546 | 1.765 | 1.595 |
| 4.486194309326085 | 1.548 | 1.765 | 1.597 |
| 4.489335901979674 | 1.551 | 1.766 | 1.598 |
| 4.492477494633264 | 1.554 | 1.766 | 1.599 |
| 4.495619087286854 | 1.557 | 1.766 | 1.6 |
| 4.498760679940443 | 1.56 | 1.766 | 1.601 |
| 4.501902272594033 | 1.563 | 1.766 | 1.603 |
| 4.505043865247622 | 1.566 | 1.766 | 1.604 |
| 4.508185457901212 | 1.569 | 1.766 | 1.606 |
| 4.511327050554801 | 1.571 | 1.766 | 1.607 |
| 4.514468643208391 | 1.574 | 1.766 | 1.608 |
| 4.517610235861981 | 1.577 | 1.766 | 1.61 |
| 4.520751828515571 | 1.58 | 1.766 | 1.611 |
| 4.52389342116916 | 1.583 | 1.766 | 1.613 |
| 4.52703501382275 | 1.586 | 1.766 | 1.615 |
| 4.530176606476339 | 1.589 | 1.767 | 1.616 |
| 4.533318199129928 | 1.592 | 1.767 | 1.618 |
| 4.536459791783518 | 1.595 | 1.767 | 1.62 |
| 4.539601384437108 | 1.598 | 1.767 | 1.621 |
| 4.542742977090698 | 1.601 | 1.767 | 1.623 |
| 4.545884569744287 | 1.604 | 1.767 | 1.625 |
| 4.549026162397876 | 1.607 | 1.767 | 1.627 |
| 4.552167755051466 | 1.61 | 1.767 | 1.629 |
| 4.555309347705056 | 1.613 | 1.767 | 1.631 |
| 4.558450940358646 | 1.616 | 1.767 | 1.633 |
| 4.561592533012235 | 1.619 | 1.767 | 1.635 |
| 4.564734125665825 | 1.622 | 1.767 | 1.637 |
| 4.567875718319415 | 1.625 | 1.767 | 1.639 |
| 4.571017310973004 | 1.628 | 1.767 | 1.641 |
| 4.574158903626594 | 1.631 | 1.767 | 1.643 |
| 4.577300496280183 | 1.634 | 1.767 | 1.646 |
| 4.580442088933772 | 1.637 | 1.767 | 1.648 |
| 4.583583681587362 | 1.64 | 1.767 | 1.65 |
| 4.586725274240952 | 1.643 | 1.767 | 1.653 |
| 4.589866866894542 | 1.646 | 1.767 | 1.655 |
| 4.593008459548131 | 1.649 | 1.767 | 1.657 |
| 4.596150052201721 | 1.652 | 1.767 | 1.66 |
| 4.59929164485531 | 1.655 | 1.767 | 1.662 |
| 4.6024332375089 | 1.658 | 1.767 | 1.665 |
| 4.60557483016249 | 1.661 | 1.767 | 1.667 |
| 4.608716422816079 | 1.664 | 1.767 | 1.67 |
| 4.611858015469668 | 1.667 | 1.767 | 1.672 |
| 4.614999608123258 | 1.67 | 1.767 | 1.675 |
| 4.618141200776848 | 1.673 | 1.767 | 1.678 |
| 4.621282793430437 | 1.677 | 1.767 | 1.68 |
| 4.624424386084027 | 1.68 | 1.767 | 1.683 |
| 4.627565978737617 | 1.683 | 1.767 | 1.686 |
| 4.630707571391206 | 1.686 | 1.767 | 1.689 |
| 4.633849164044795 | 1.689 | 1.767 | 1.691 |
| 4.636990756698386 | 1.692 | 1.767 | 1.694 |
| 4.640132349351975 | 1.695 | 1.767 | 1.697 |
| 4.643273942005564 | 1.698 | 1.767 | 1.7 |
| 4.646415534659154 | 1.701 | 1.767 | 1.703 |
| 4.649557127312744 | 1.704 | 1.767 | 1.706 |
| 4.652698719966334 | 1.708 | 1.767 | 1.709 |
| 4.655840312619923 | 1.711 | 1.767 | 1.712 |
| 4.658981905273513 | 1.714 | 1.767 | 1.715 |
| 4.662123497927102 | 1.717 | 1.767 | 1.718 |
| 4.665265090580692 | 1.72 | 1.767 | 1.721 |
| 4.668406683234282 | 1.723 | 1.767 | 1.724 |
| 4.671548275887871 | 1.726 | 1.767 | 1.727 |
| 4.674689868541461 | 1.729 | 1.767 | 1.73 |
| 4.67783146119505 | 1.733 | 1.767 | 1.733 |
| 4.68097305384864 | 1.736 | 1.767 | 1.736 |
| 4.68411464650223 | 1.739 | 1.767 | 1.739 |
| 4.687256239155819 | 1.742 | 1.767 | 1.742 |
| 4.690397831809409 | 1.745 | 1.767 | 1.745 |
| 4.693539424462998 | 1.748 | 1.767 | 1.748 |
| 4.696681017116588 | 1.751 | 1.767 | 1.751 |
| 4.699822609770177 | 1.755 | 1.767 | 1.755 |
| 4.702964202423767 | 1.758 | 1.767 | 1.758 |
| 4.706105795077356 | 1.761 | 1.767 | 1.761 |
| 4.709247387730946 | 1.764 | 1.767 | 1.764 |
| 4.712388980384535 | 1.767 | 1.767 | 1.767 |
| 4.715530573038126 | 1.77 | 1.767 | 1.77 |
| 4.718672165691715 | 1.773 | 1.767 | 1.773 |
| 4.721813758345305 | 1.777 | 1.767 | 1.777 |
| 4.724955350998894 | 1.78 | 1.767 | 1.78 |
| 4.728096943652484 | 1.783 | 1.767 | 1.783 |
| 4.731238536306074 | 1.786 | 1.767 | 1.786 |
| 4.734380128959663 | 1.789 | 1.767 | 1.789 |
| 4.737521721613253 | 1.792 | 1.767 | 1.792 |
| 4.740663314266842 | 1.795 | 1.767 | 1.795 |
| 4.743804906920432 | 1.799 | 1.767 | 1.798 |
| 4.74694649957402 | 1.802 | 1.767 | 1.801 |
| 4.750088092227611 | 1.805 | 1.767 | 1.805 |
| 4.7532296848812 | 1.808 | 1.767 | 1.808 |
| 4.75637127753479 | 1.811 | 1.767 | 1.811 |
| 4.75951287018838 | 1.814 | 1.767 | 1.814 |
| 4.76265446284197 | 1.817 | 1.767 | 1.817 |
| 4.765796055495559 | 1.82 | 1.767 | 1.82 |
| 4.768937648149149 | 1.824 | 1.767 | 1.823 |
| 4.772079240802738 | 1.827 | 1.767 | 1.826 |
| 4.775220833456327 | 1.83 | 1.767 | 1.829 |
| 4.778362426109917 | 1.833 | 1.767 | 1.831 |
| 4.781504018763507 | 1.836 | 1.767 | 1.834 |
| 4.784645611417097 | 1.839 | 1.767 | 1.837 |
| 4.787787204070686 | 1.842 | 1.767 | 1.84 |
| 4.790928796724275 | 1.845 | 1.767 | 1.843 |
| 4.794070389377865 | 1.848 | 1.767 | 1.846 |
| 4.797211982031455 | 1.852 | 1.767 | 1.848 |
| 4.800353574685045 | 1.855 | 1.767 | 1.851 |
| 4.803495167338634 | 1.858 | 1.767 | 1.854 |
| 4.806636759992224 | 1.861 | 1.767 | 1.857 |
| 4.809778352645814 | 1.864 | 1.767 | 1.859 |
| 4.812919945299403 | 1.867 | 1.767 | 1.862 |
| 4.816061537952993 | 1.87 | 1.767 | 1.864 |
| 4.819203130606582 | 1.873 | 1.767 | 1.867 |
| 4.822344723260172 | 1.876 | 1.767 | 1.87 |
| 4.825486315913761 | 1.879 | 1.767 | 1.872 |
| 4.828627908567351 | 1.882 | 1.767 | 1.875 |
| 4.83176950122094 | 1.885 | 1.767 | 1.877 |
| 4.83491109387453 | 1.888 | 1.767 | 1.879 |
| 4.83805268652812 | 1.891 | 1.767 | 1.882 |
| 4.841194279181709 | 1.895 | 1.767 | 1.884 |
| 4.844335871835299 | 1.898 | 1.767 | 1.886 |
| 4.847477464488889 | 1.901 | 1.767 | 1.889 |
| 4.850619057142478 | 1.904 | 1.767 | 1.891 |
| 4.853760649796068 | 1.907 | 1.767 | 1.893 |
| 4.856902242449657 | 1.91 | 1.767 | 1.895 |
| 4.860043835103247 | 1.913 | 1.767 | 1.897 |
| 4.863185427756837 | 1.916 | 1.767 | 1.899 |
| 4.866327020410426 | 1.919 | 1.767 | 1.901 |
| 4.869468613064015 | 1.922 | 1.767 | 1.903 |
| 4.872610205717605 | 1.925 | 1.767 | 1.905 |
| 4.875751798371195 | 1.928 | 1.767 | 1.907 |
| 4.878893391024784 | 1.931 | 1.768 | 1.909 |
| 4.882034983678374 | 1.934 | 1.768 | 1.911 |
| 4.885176576331964 | 1.937 | 1.768 | 1.913 |
| 4.888318168985553 | 1.94 | 1.768 | 1.915 |
| 4.891459761639143 | 1.942 | 1.768 | 1.916 |
| 4.894601354292733 | 1.945 | 1.768 | 1.918 |
| 4.897742946946322 | 1.948 | 1.768 | 1.92 |
| 4.900884539599912 | 1.951 | 1.768 | 1.921 |
| 4.904026132253501 | 1.954 | 1.768 | 1.923 |
| 4.907167724907091 | 1.957 | 1.768 | 1.924 |
| 4.91030931756068 | 1.96 | 1.768 | 1.926 |
| 4.91345091021427 | 1.963 | 1.768 | 1.927 |
| 4.91659250286786 | 1.966 | 1.768 | 1.929 |
| 4.91973409552145 | 1.969 | 1.768 | 1.93 |
| 4.922875688175039 | 1.972 | 1.768 | 1.932 |
| 4.926017280828628 | 1.974 | 1.768 | 1.933 |
| 4.929158873482218 | 1.977 | 1.769 | 1.934 |
| 4.932300466135808 | 1.98 | 1.769 | 1.935 |
| 4.935442058789397 | 1.983 | 1.769 | 1.937 |
| 4.938583651442987 | 1.986 | 1.769 | 1.938 |
| 4.941725244096576 | 1.989 | 1.769 | 1.939 |
| 4.944866836750166 | 1.991 | 1.769 | 1.94 |
| 4.948008429403755 | 1.994 | 1.769 | 1.941 |
| 4.951150022057345 | 1.997 | 1.769 | 1.942 |
| 4.954291614710935 | 2 | 1.77 | 1.943 |
| 4.957433207364524 | 2.003 | 1.77 | 1.944 |
| 4.960574800018114 | 2.005 | 1.77 | 1.945 |
| 4.963716392671704 | 2.008 | 1.77 | 1.946 |
| 4.966857985325293 | 2.011 | 1.77 | 1.947 |
| 4.969999577978883 | 2.014 | 1.77 | 1.948 |
| 4.973141170632472 | 2.016 | 1.771 | 1.948 |
| 4.976282763286062 | 2.019 | 1.771 | 1.949 |
| 4.979424355939651 | 2.022 | 1.771 | 1.95 |
| 4.982565948593241 | 2.025 | 1.771 | 1.951 |
| 4.985707541246831 | 2.027 | 1.771 | 1.951 |
| 4.98884913390042 | 2.03 | 1.772 | 1.952 |
| 4.99199072655401 | 2.033 | 1.772 | 1.953 |
| 4.9951323192076 | 2.035 | 1.772 | 1.953 |
| 4.99827391186119 | 2.038 | 1.772 | 1.954 |
| 5.00141550451478 | 2.041 | 1.773 | 1.954 |
| 5.004557097168369 | 2.043 | 1.773 | 1.955 |
| 5.007698689821958 | 2.046 | 1.773 | 1.955 |
| 5.010840282475548 | 2.049 | 1.774 | 1.956 |
| 5.013981875129137 | 2.051 | 1.774 | 1.956 |
| 5.017123467782727 | 2.054 | 1.774 | 1.957 |
| 5.020265060436317 | 2.056 | 1.775 | 1.957 |
| 5.023406653089906 | 2.059 | 1.775 | 1.958 |
| 5.026548245743496 | 2.062 | 1.775 | 1.958 |
| 5.029689838397085 | 2.064 | 1.776 | 1.958 |
| 5.032831431050674 | 2.067 | 1.776 | 1.959 |
| 5.035973023704264 | 2.069 | 1.776 | 1.959 |
| 5.039114616357854 | 2.072 | 1.777 | 1.959 |
| 5.042256209011444 | 2.074 | 1.777 | 1.96 |
| 5.045397801665033 | 2.077 | 1.778 | 1.96 |
| 5.048539394318622 | 2.079 | 1.778 | 1.96 |
| 5.051680986972213 | 2.082 | 1.779 | 1.961 |
| 5.054822579625802 | 2.084 | 1.779 | 1.961 |
| 5.057964172279392 | 2.087 | 1.78 | 1.961 |
| 5.061105764932981 | 2.089 | 1.78 | 1.961 |
| 5.064247357586571 | 2.092 | 1.781 | 1.961 |
| 5.067388950240161 | 2.094 | 1.781 | 1.962 |
| 5.07053054289375 | 2.097 | 1.782 | 1.962 |
| 5.07367213554734 | 2.099 | 1.782 | 1.962 |
| 5.07681372820093 | 2.101 | 1.783 | 1.962 |
| 5.079955320854519 | 2.104 | 1.784 | 1.962 |
| 5.083096913508108 | 2.106 | 1.784 | 1.962 |
| 5.086238506161698 | 2.108 | 1.785 | 1.962 |
| 5.089380098815288 | 2.111 | 1.786 | 1.962 |
| 5.092521691468877 | 2.113 | 1.786 | 1.963 |
| 5.095663284122466 | 2.116 | 1.787 | 1.963 |
| 5.098804876776057 | 2.118 | 1.788 | 1.963 |
| 5.101946469429646 | 2.12 | 1.789 | 1.963 |
| 5.105088062083236 | 2.122 | 1.789 | 1.963 |
| 5.108229654736825 | 2.125 | 1.79 | 1.963 |
| 5.111371247390415 | 2.127 | 1.791 | 1.963 |
| 5.114512840044005 | 2.129 | 1.792 | 1.963 |
| 5.117654432697594 | 2.131 | 1.793 | 1.963 |
| 5.120796025351184 | 2.134 | 1.794 | 1.963 |
| 5.123937618004773 | 2.136 | 1.794 | 1.963 |
| 5.127079210658363 | 2.138 | 1.795 | 1.963 |
| 5.130220803311953 | 2.14 | 1.796 | 1.963 |
| 5.133362395965542 | 2.143 | 1.797 | 1.963 |
| 5.136503988619131 | 2.145 | 1.798 | 1.963 |
| 5.13964558127272 | 2.147 | 1.799 | 1.963 |
| 5.142787173926311 | 2.149 | 1.8 | 1.963 |
| 5.1459287665799 | 2.151 | 1.801 | 1.963 |
| 5.14907035923349 | 2.153 | 1.802 | 1.963 |
| 5.15221195188708 | 2.155 | 1.804 | 1.963 |
| 5.15535354454067 | 2.158 | 1.805 | 1.963 |
| 5.158495137194259 | 2.16 | 1.806 | 1.963 |
| 5.161636729847848 | 2.162 | 1.807 | 1.963 |
| 5.164778322501438 | 2.164 | 1.808 | 1.963 |
| 5.167919915155028 | 2.166 | 1.809 | 1.963 |
| 5.171061507808617 | 2.168 | 1.811 | 1.963 |
| 5.174203100462206 | 2.17 | 1.812 | 1.963 |
| 5.177344693115796 | 2.172 | 1.813 | 1.963 |
| 5.180486285769386 | 2.174 | 1.814 | 1.963 |
| 5.183627878422976 | 2.176 | 1.816 | 1.963 |
| 5.186769471076565 | 2.178 | 1.817 | 1.963 |
| 5.189911063730155 | 2.18 | 1.819 | 1.963 |
| 5.193052656383744 | 2.182 | 1.82 | 1.963 |
| 5.196194249037334 | 2.184 | 1.821 | 1.963 |
| 5.199335841690924 | 2.186 | 1.823 | 1.963 |
| 5.202477434344513 | 2.187 | 1.824 | 1.963 |
| 5.205619026998103 | 2.189 | 1.826 | 1.963 |
| 5.208760619651692 | 2.191 | 1.827 | 1.963 |
| 5.211902212305282 | 2.193 | 1.829 | 1.963 |
| 5.215043804958871 | 2.195 | 1.83 | 1.963 |
| 5.218185397612461 | 2.197 | 1.832 | 1.963 |
| 5.221326990266051 | 2.199 | 1.834 | 1.963 |
| 5.22446858291964 | 2.2 | 1.835 | 1.963 |
| 5.22761017557323 | 2.202 | 1.837 | 1.963 |
| 5.23075176822682 | 2.204 | 1.839 | 1.963 |
| 5.23389336088041 | 2.206 | 1.841 | 1.963 |
| 5.237034953533999 | 2.208 | 1.842 | 1.963 |
| 5.240176546187588 | 2.209 | 1.844 | 1.963 |
| 5.243318138841178 | 2.211 | 1.846 | 1.963 |
| 5.246459731494767 | 2.213 | 1.848 | 1.963 |
| 5.249601324148357 | 2.215 | 1.85 | 1.963 |
| 5.252742916801947 | 2.216 | 1.851 | 1.963 |
| 5.255884509455536 | 2.218 | 1.853 | 1.963 |
| 5.259026102109125 | 2.22 | 1.855 | 1.963 |
| 5.262167694762715 | 2.221 | 1.857 | 1.963 |
| 5.265309287416305 | 2.223 | 1.859 | 1.963 |
| 5.268450880069895 | 2.225 | 1.861 | 1.963 |
| 5.271592472723484 | 2.226 | 1.863 | 1.963 |
| 5.274734065377074 | 2.228 | 1.865 | 1.963 |
| 5.277875658030664 | 2.229 | 1.868 | 1.963 |
| 5.281017250684253 | 2.231 | 1.87 | 1.963 |
| 5.284158843337843 | 2.233 | 1.872 | 1.963 |
| 5.287300435991432 | 2.234 | 1.874 | 1.964 |
| 5.290442028645022 | 2.236 | 1.876 | 1.964 |
| 5.293583621298612 | 2.237 | 1.878 | 1.964 |
| 5.296725213952201 | 2.239 | 1.881 | 1.964 |
| 5.299866806605791 | 2.24 | 1.883 | 1.964 |
| 5.30300839925938 | 2.242 | 1.885 | 1.964 |
| 5.30614999191297 | 2.243 | 1.887 | 1.964 |
| 5.30929158456656 | 2.245 | 1.89 | 1.964 |
| 5.312433177220149 | 2.246 | 1.892 | 1.964 |
| 5.315574769873739 | 2.248 | 1.895 | 1.964 |
| 5.318716362527328 | 2.249 | 1.897 | 1.964 |
| 5.321857955180918 | 2.251 | 1.899 | 1.964 |
| 5.324999547834508 | 2.252 | 1.902 | 1.964 |
| 5.328141140488097 | 2.253 | 1.904 | 1.964 |
| 5.331282733141686 | 2.255 | 1.907 | 1.964 |
| 5.334424325795276 | 2.256 | 1.909 | 1.964 |
| 5.337565918448866 | 2.258 | 1.912 | 1.964 |
| 5.340707511102456 | 2.259 | 1.914 | 1.964 |
| 5.343849103756045 | 2.26 | 1.917 | 1.964 |
| 5.346990696409634 | 2.262 | 1.92 | 1.964 |
| 5.350132289063224 | 2.263 | 1.922 | 1.964 |
| 5.353273881716814 | 2.264 | 1.925 | 1.964 |
| 5.356415474370403 | 2.265 | 1.928 | 1.964 |
| 5.359557067023993 | 2.267 | 1.93 | 1.964 |
| 5.362698659677583 | 2.268 | 1.933 | 1.964 |
| 5.365840252331172 | 2.269 | 1.936 | 1.964 |
| 5.368981844984762 | 2.271 | 1.938 | 1.964 |
| 5.372123437638351 | 2.272 | 1.941 | 1.964 |
| 5.375265030291941 | 2.273 | 1.944 | 1.964 |
| 5.378406622945531 | 2.274 | 1.947 | 1.964 |
| 5.38154821559912 | 2.275 | 1.95 | 1.964 |
| 5.38468980825271 | 2.277 | 1.952 | 1.965 |
| 5.387831400906299 | 2.278 | 1.955 | 1.965 |
| 5.39097299355989 | 2.279 | 1.958 | 1.965 |
| 5.394114586213479 | 2.28 | 1.961 | 1.965 |
| 5.397256178867068 | 2.281 | 1.964 | 1.965 |
| 5.400397771520657 | 2.282 | 1.967 | 1.965 |
| 5.403539364174247 | 2.283 | 1.97 | 1.965 |
| 5.406680956827837 | 2.285 | 1.973 | 1.966 |
| 5.409822549481426 | 2.286 | 1.975 | 1.966 |
| 5.412964142135016 | 2.287 | 1.978 | 1.966 |
| 5.416105734788605 | 2.288 | 1.981 | 1.966 |
| 5.419247327442195 | 2.289 | 1.984 | 1.966 |
| 5.422388920095785 | 2.29 | 1.987 | 1.967 |
| 5.425530512749375 | 2.291 | 1.99 | 1.967 |
| 5.428672105402964 | 2.292 | 1.993 | 1.967 |
| 5.431813698056554 | 2.293 | 1.996 | 1.967 |
| 5.434955290710143 | 2.294 | 1.999 | 1.968 |
| 5.438096883363733 | 2.295 | 2.003 | 1.968 |
| 5.441238476017322 | 2.296 | 2.006 | 1.968 |
| 5.444380068670912 | 2.297 | 2.009 | 1.969 |
| 5.447521661324502 | 2.298 | 2.012 | 1.969 |
| 5.450663253978091 | 2.299 | 2.015 | 1.97 |
| 5.453804846631681 | 2.3 | 2.018 | 1.97 |
| 5.456946439285271 | 2.301 | 2.021 | 1.97 |
| 5.46008803193886 | 2.302 | 2.024 | 1.971 |
| 5.46322962459245 | 2.302 | 2.027 | 1.971 |
| 5.466371217246039 | 2.303 | 2.03 | 1.972 |
| 5.46951280989963 | 2.304 | 2.033 | 1.972 |
| 5.472654402553218 | 2.305 | 2.037 | 1.973 |
| 5.475795995206808 | 2.306 | 2.04 | 1.974 |
| 5.478937587860398 | 2.307 | 2.043 | 1.974 |
| 5.482079180513987 | 2.308 | 2.046 | 1.975 |
| 5.485220773167577 | 2.308 | 2.049 | 1.975 |
| 5.488362365821166 | 2.309 | 2.052 | 1.976 |
| 5.491503958474756 | 2.31 | 2.055 | 1.977 |
| 5.494645551128346 | 2.311 | 2.059 | 1.978 |
| 5.497787143781935 | 2.312 | 2.062 | 1.978 |
| 5.500928736435525 | 2.312 | 2.065 | 1.979 |
| 5.504070329089115 | 2.313 | 2.068 | 1.98 |
| 5.507211921742704 | 2.314 | 2.071 | 1.981 |
| 5.510353514396294 | 2.315 | 2.074 | 1.982 |
| 5.513495107049883 | 2.315 | 2.077 | 1.983 |
| 5.516636699703473 | 2.316 | 2.081 | 1.984 |
| 5.519778292357062 | 2.317 | 2.084 | 1.985 |
| 5.522919885010652 | 2.318 | 2.087 | 1.986 |
| 5.526061477664242 | 2.318 | 2.09 | 1.987 |
| 5.529203070317831 | 2.319 | 2.093 | 1.988 |
| 5.532344662971421 | 2.32 | 2.096 | 1.989 |
| 5.535486255625011 | 2.32 | 2.099 | 1.99 |
| 5.5386278482786 | 2.321 | 2.102 | 1.991 |
| 5.54176944093219 | 2.322 | 2.105 | 1.992 |
| 5.544911033585779 | 2.322 | 2.109 | 1.994 |
| 5.54805262623937 | 2.323 | 2.112 | 1.995 |
| 5.551194218892959 | 2.324 | 2.115 | 1.996 |
| 5.554335811546548 | 2.324 | 2.118 | 1.998 |
| 5.557477404200137 | 2.325 | 2.121 | 1.999 |
| 5.560618996853727 | 2.325 | 2.124 | 2.001 |
| 5.563760589507317 | 2.326 | 2.127 | 2.002 |
| 5.566902182160906 | 2.327 | 2.13 | 2.004 |
| 5.570043774814496 | 2.327 | 2.133 | 2.005 |
| 5.573185367468086 | 2.328 | 2.136 | 2.007 |
| 5.576326960121675 | 2.328 | 2.139 | 2.008 |
| 5.579468552775264 | 2.329 | 2.142 | 2.01 |
| 5.582610145428854 | 2.329 | 2.145 | 2.012 |
| 5.585751738082444 | 2.33 | 2.148 | 2.014 |
| 5.588893330736034 | 2.331 | 2.151 | 2.015 |
| 5.592034923389623 | 2.331 | 2.154 | 2.017 |
| 5.595176516043213 | 2.332 | 2.157 | 2.019 |
| 5.598318108696803 | 2.332 | 2.16 | 2.021 |
| 5.601459701350392 | 2.333 | 2.162 | 2.023 |
| 5.604601294003982 | 2.333 | 2.165 | 2.025 |
| 5.607742886657571 | 2.334 | 2.168 | 2.027 |
| 5.610884479311161 | 2.334 | 2.171 | 2.029 |
| 5.61402607196475 | 2.335 | 2.174 | 2.031 |
| 5.61716766461834 | 2.335 | 2.177 | 2.033 |
| 5.62030925727193 | 2.335 | 2.179 | 2.035 |
| 5.623450849925519 | 2.336 | 2.182 | 2.038 |
| 5.626592442579109 | 2.336 | 2.185 | 2.04 |
| 5.629734035232698 | 2.337 | 2.188 | 2.042 |
| 5.632875627886288 | 2.337 | 2.19 | 2.044 |
| 5.636017220539878 | 2.338 | 2.193 | 2.047 |
| 5.639158813193467 | 2.338 | 2.196 | 2.049 |
| 5.642300405847057 | 2.338 | 2.198 | 2.052 |
| 5.645441998500646 | 2.339 | 2.201 | 2.054 |
| 5.648583591154236 | 2.339 | 2.204 | 2.057 |
| 5.651725183807825 | 2.34 | 2.206 | 2.059 |
| 5.654866776461415 | 2.34 | 2.209 | 2.062 |
| 5.658008369115005 | 2.34 | 2.211 | 2.064 |
| 5.661149961768594 | 2.341 | 2.214 | 2.067 |
| 5.664291554422184 | 2.341 | 2.217 | 2.07 |
| 5.667433147075774 | 2.341 | 2.219 | 2.072 |
| 5.670574739729363 | 2.342 | 2.221 | 2.075 |
| 5.673716332382953 | 2.342 | 2.224 | 2.078 |
| 5.676857925036542 | 2.342 | 2.226 | 2.08 |
| 5.679999517690132 | 2.343 | 2.229 | 2.083 |
| 5.683141110343721 | 2.343 | 2.231 | 2.086 |
| 5.686282702997311 | 2.343 | 2.234 | 2.089 |
| 5.689424295650901 | 2.344 | 2.236 | 2.092 |
| 5.69256588830449 | 2.344 | 2.238 | 2.095 |
| 5.69570748095808 | 2.344 | 2.24 | 2.098 |
| 5.69884907361167 | 2.345 | 2.243 | 2.1 |
| 5.701990666265259 | 2.345 | 2.245 | 2.103 |
| 5.705132258918849 | 2.345 | 2.247 | 2.106 |
| 5.708273851572438 | 2.345 | 2.249 | 2.109 |
| 5.711415444226028 | 2.346 | 2.252 | 2.112 |
| 5.714557036879618 | 2.346 | 2.254 | 2.115 |
| 5.717698629533207 | 2.346 | 2.256 | 2.118 |
| 5.720840222186797 | 2.347 | 2.258 | 2.121 |
| 5.723981814840386 | 2.347 | 2.26 | 2.125 |
| 5.727123407493976 | 2.347 | 2.262 | 2.128 |
| 5.730265000147565 | 2.347 | 2.264 | 2.131 |
| 5.733406592801155 | 2.347 | 2.266 | 2.134 |
| 5.736548185454744 | 2.348 | 2.268 | 2.137 |
| 5.739689778108334 | 2.348 | 2.27 | 2.14 |
| 5.742831370761924 | 2.348 | 2.272 | 2.143 |
| 5.745972963415514 | 2.348 | 2.274 | 2.146 |
| 5.749114556069103 | 2.349 | 2.276 | 2.149 |
| 5.752256148722693 | 2.349 | 2.277 | 2.153 |
| 5.755397741376282 | 2.349 | 2.279 | 2.156 |
| 5.758539334029872 | 2.349 | 2.281 | 2.159 |
| 5.761680926683462 | 2.349 | 2.283 | 2.162 |
| 5.764822519337051 | 2.35 | 2.285 | 2.165 |
| 5.767964111990641 | 2.35 | 2.286 | 2.168 |
| 5.77110570464423 | 2.35 | 2.288 | 2.171 |
| 5.77424729729782 | 2.35 | 2.29 | 2.174 |
| 5.77738888995141 | 2.35 | 2.291 | 2.178 |
| 5.780530482605 | 2.351 | 2.293 | 2.181 |
| 5.783672075258588 | 2.351 | 2.294 | 2.184 |
| 5.786813667912178 | 2.351 | 2.296 | 2.187 |
| 5.789955260565768 | 2.351 | 2.298 | 2.19 |
| 5.793096853219358 | 2.351 | 2.299 | 2.193 |
| 5.796238445872947 | 2.351 | 2.301 | 2.196 |
| 5.799380038526537 | 2.351 | 2.302 | 2.199 |
| 5.802521631180126 | 2.352 | 2.303 | 2.202 |
| 5.805663223833715 | 2.352 | 2.305 | 2.205 |
| 5.808804816487306 | 2.352 | 2.306 | 2.208 |
| 5.811946409140895 | 2.352 | 2.308 | 2.211 |
| 5.815088001794485 | 2.352 | 2.309 | 2.214 |
| 5.818229594448074 | 2.352 | 2.31 | 2.217 |
| 5.821371187101663 | 2.352 | 2.311 | 2.22 |
| 5.824512779755254 | 2.353 | 2.313 | 2.223 |
| 5.827654372408843 | 2.353 | 2.314 | 2.226 |
| 5.830795965062433 | 2.353 | 2.315 | 2.229 |
| 5.833937557716022 | 2.353 | 2.316 | 2.232 |
| 5.837079150369612 | 2.353 | 2.318 | 2.235 |
| 5.840220743023201 | 2.353 | 2.319 | 2.237 |
| 5.843362335676791 | 2.353 | 2.32 | 2.24 |
| 5.846503928330381 | 2.353 | 2.321 | 2.243 |
| 5.84964552098397 | 2.353 | 2.322 | 2.246 |
| 5.85278711363756 | 2.353 | 2.323 | 2.248 |
| 5.85592870629115 | 2.354 | 2.324 | 2.251 |
| 5.85907029894474 | 2.354 | 2.325 | 2.254 |
| 5.862211891598329 | 2.354 | 2.326 | 2.256 |
| 5.865353484251918 | 2.354 | 2.327 | 2.259 |
| 5.868495076905508 | 2.354 | 2.328 | 2.261 |
| 5.871636669559098 | 2.354 | 2.329 | 2.264 |
| 5.874778262212687 | 2.354 | 2.33 | 2.266 |
| 5.877919854866277 | 2.354 | 2.331 | 2.269 |
| 5.881061447519866 | 2.354 | 2.331 | 2.271 |
| 5.884203040173456 | 2.354 | 2.332 | 2.274 |
| 5.887344632827046 | 2.354 | 2.333 | 2.276 |
| 5.890486225480635 | 2.354 | 2.334 | 2.278 |
| 5.893627818134224 | 2.355 | 2.335 | 2.281 |
| 5.896769410787814 | 2.355 | 2.335 | 2.283 |
| 5.899911003441404 | 2.355 | 2.336 | 2.285 |
| 5.903052596094994 | 2.355 | 2.337 | 2.287 |
| 5.906194188748583 | 2.355 | 2.338 | 2.289 |
| 5.909335781402172 | 2.355 | 2.338 | 2.291 |
| 5.912477374055762 | 2.355 | 2.339 | 2.293 |
| 5.915618966709352 | 2.355 | 2.34 | 2.295 |
| 5.918760559362942 | 2.355 | 2.34 | 2.297 |
| 5.921902152016531 | 2.355 | 2.341 | 2.299 |
| 5.92504374467012 | 2.355 | 2.341 | 2.301 |
| 5.92818533732371 | 2.355 | 2.342 | 2.303 |
| 5.9313269299773 | 2.355 | 2.343 | 2.305 |
| 5.93446852263089 | 2.355 | 2.343 | 2.307 |
| 5.93761011528448 | 2.355 | 2.344 | 2.308 |
| 5.940751707938068 | 2.355 | 2.344 | 2.31 |
| 5.943893300591658 | 2.355 | 2.345 | 2.312 |
| 5.947034893245248 | 2.355 | 2.345 | 2.313 |
| 5.950176485898837 | 2.355 | 2.346 | 2.315 |
| 5.953318078552427 | 2.355 | 2.346 | 2.317 |
| 5.956459671206017 | 2.355 | 2.346 | 2.318 |
| 5.959601263859606 | 2.356 | 2.347 | 2.32 |
| 5.962742856513196 | 2.356 | 2.347 | 2.321 |
| 5.965884449166785 | 2.356 | 2.348 | 2.322 |
| 5.969026041820375 | 2.356 | 2.348 | 2.324 |
| 5.972167634473964 | 2.356 | 2.348 | 2.325 |
| 5.975309227127554 | 2.356 | 2.349 | 2.326 |
| 5.978450819781144 | 2.356 | 2.349 | 2.328 |
| 5.981592412434733 | 2.356 | 2.349 | 2.329 |
| 5.984734005088323 | 2.356 | 2.35 | 2.33 |
| 5.987875597741913 | 2.356 | 2.35 | 2.331 |
| 5.991017190395502 | 2.356 | 2.35 | 2.332 |
| 5.994158783049092 | 2.356 | 2.351 | 2.333 |
| 5.997300375702681 | 2.356 | 2.351 | 2.334 |
| 6.000441968356271 | 2.356 | 2.351 | 2.335 |
| 6.003583561009861 | 2.356 | 2.351 | 2.336 |
| 6.00672515366345 | 2.356 | 2.352 | 2.337 |
| 6.00986674631704 | 2.356 | 2.352 | 2.338 |
| 6.01300833897063 | 2.356 | 2.352 | 2.339 |
| 6.01614993162422 | 2.356 | 2.352 | 2.34 |
| 6.019291524277808 | 2.356 | 2.353 | 2.341 |
| 6.022433116931398 | 2.356 | 2.353 | 2.342 |
| 6.025574709584988 | 2.356 | 2.353 | 2.342 |
| 6.028716302238577 | 2.356 | 2.353 | 2.343 |
| 6.031857894892167 | 2.356 | 2.353 | 2.344 |
| 6.034999487545757 | 2.356 | 2.354 | 2.344 |
| 6.038141080199346 | 2.356 | 2.354 | 2.345 |
| 6.041282672852935 | 2.356 | 2.354 | 2.346 |
| 6.044424265506525 | 2.356 | 2.354 | 2.346 |
| 6.047565858160115 | 2.356 | 2.354 | 2.347 |
| 6.050707450813704 | 2.356 | 2.354 | 2.347 |
| 6.053849043467294 | 2.356 | 2.354 | 2.348 |
| 6.056990636120884 | 2.356 | 2.354 | 2.348 |
| 6.060132228774473 | 2.356 | 2.355 | 2.349 |
| 6.063273821428063 | 2.356 | 2.355 | 2.349 |
| 6.066415414081653 | 2.356 | 2.355 | 2.35 |
| 6.069557006735242 | 2.356 | 2.355 | 2.35 |
| 6.072698599388831 | 2.356 | 2.355 | 2.351 |
| 6.07584019204242 | 2.356 | 2.355 | 2.351 |
| 6.078981784696011 | 2.356 | 2.355 | 2.351 |
| 6.082123377349601 | 2.356 | 2.355 | 2.352 |
| 6.08526497000319 | 2.356 | 2.355 | 2.352 |
| 6.08840656265678 | 2.356 | 2.355 | 2.352 |
| 6.09154815531037 | 2.356 | 2.355 | 2.353 |
| 6.094689747963959 | 2.356 | 2.355 | 2.353 |
| 6.097831340617549 | 2.356 | 2.356 | 2.353 |
| 6.100972933271138 | 2.356 | 2.356 | 2.353 |
| 6.104114525924728 | 2.356 | 2.356 | 2.354 |
| 6.107256118578317 | 2.356 | 2.356 | 2.354 |
| 6.110397711231907 | 2.356 | 2.356 | 2.354 |
| 6.113539303885497 | 2.356 | 2.356 | 2.354 |
| 6.116680896539086 | 2.356 | 2.356 | 2.354 |
| 6.119822489192675 | 2.356 | 2.356 | 2.355 |
| 6.122964081846265 | 2.356 | 2.356 | 2.355 |
| 6.126105674499855 | 2.356 | 2.356 | 2.355 |
| 6.129247267153445 | 2.356 | 2.356 | 2.355 |
| 6.132388859807034 | 2.356 | 2.356 | 2.355 |
| 6.135530452460624 | 2.356 | 2.356 | 2.355 |
| 6.138672045114213 | 2.356 | 2.356 | 2.355 |
| 6.141813637767803 | 2.356 | 2.356 | 2.355 |
| 6.144955230421393 | 2.356 | 2.356 | 2.355 |
| 6.148096823074982 | 2.356 | 2.356 | 2.356 |
| 6.151238415728571 | 2.356 | 2.356 | 2.356 |
| 6.154380008382161 | 2.356 | 2.356 | 2.356 |
| 6.157521601035751 | 2.356 | 2.356 | 2.356 |
| 6.16066319368934 | 2.356 | 2.356 | 2.356 |
| 6.16380478634293 | 2.356 | 2.356 | 2.356 |
| 6.16694637899652 | 2.356 | 2.356 | 2.356 |
| 6.170087971650109 | 2.356 | 2.356 | 2.356 |
| 6.173229564303698 | 2.356 | 2.356 | 2.356 |
| 6.176371156957289 | 2.356 | 2.356 | 2.356 |
| 6.179512749610878 | 2.356 | 2.356 | 2.356 |
| 6.182654342264468 | 2.356 | 2.356 | 2.356 |
| 6.185795934918057 | 2.356 | 2.356 | 2.356 |
| 6.188937527571647 | 2.356 | 2.356 | 2.356 |
| 6.192079120225237 | 2.356 | 2.356 | 2.356 |
| 6.195220712878826 | 2.356 | 2.356 | 2.356 |
| 6.198362305532415 | 2.356 | 2.356 | 2.356 |
| 6.201503898186005 | 2.356 | 2.356 | 2.356 |
| 6.204645490839594 | 2.356 | 2.356 | 2.356 |
| 6.207787083493184 | 2.356 | 2.356 | 2.356 |
| 6.210928676146774 | 2.356 | 2.356 | 2.356 |
| 6.214070268800364 | 2.356 | 2.356 | 2.356 |
| 6.217211861453953 | 2.356 | 2.356 | 2.356 |
| 6.220353454107543 | 2.356 | 2.356 | 2.356 |
| 6.223495046761133 | 2.356 | 2.356 | 2.356 |
| 6.226636639414722 | 2.356 | 2.356 | 2.356 |
| 6.229778232068312 | 2.356 | 2.356 | 2.356 |
| 6.232919824721901 | 2.356 | 2.356 | 2.356 |
| 6.236061417375491 | 2.356 | 2.356 | 2.356 |
| 6.23920301002908 | 2.356 | 2.356 | 2.356 |
| 6.24234460268267 | 2.356 | 2.356 | 2.356 |
| 6.24548619533626 | 2.356 | 2.356 | 2.356 |
| 6.24862778798985 | 2.356 | 2.356 | 2.356 |
| 6.251769380643438 | 2.356 | 2.356 | 2.356 |
| 6.254910973297028 | 2.356 | 2.356 | 2.356 |
| 6.258052565950618 | 2.356 | 2.356 | 2.356 |
| 6.261194158604208 | 2.356 | 2.356 | 2.356 |
| 6.264335751257797 | 2.356 | 2.356 | 2.356 |
| 6.267477343911387 | 2.356 | 2.356 | 2.356 |
| 6.270618936564976 | 2.356 | 2.356 | 2.356 |
| 6.273760529218566 | 2.356 | 2.356 | 2.356 |
| 6.276902121872155 | 2.356 | 2.356 | 2.356 |
| 6.280043714525745 | 2.356 | 2.356 | 2.356 |
| 6.283185307179335 | 2.356 | 2.356 | 2.356 |